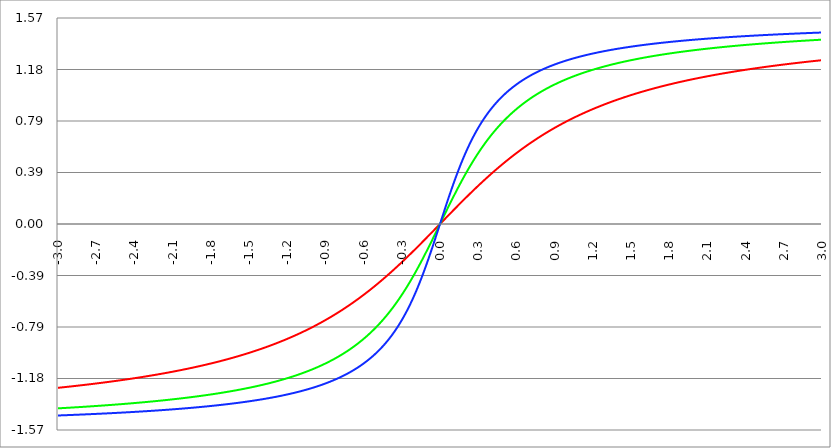
| Category | Series 1 | Series 0 | Series 2 |
|---|---|---|---|
| -3.0 | -1.249 | -1.406 | -1.46 |
| -2.997 | -1.249 | -1.405 | -1.46 |
| -2.994 | -1.248 | -1.405 | -1.46 |
| -2.991 | -1.248 | -1.405 | -1.46 |
| -2.988 | -1.248 | -1.405 | -1.46 |
| -2.984999999999999 | -1.248 | -1.405 | -1.46 |
| -2.981999999999999 | -1.247 | -1.405 | -1.459 |
| -2.978999999999999 | -1.247 | -1.405 | -1.459 |
| -2.975999999999999 | -1.247 | -1.404 | -1.459 |
| -2.972999999999999 | -1.246 | -1.404 | -1.459 |
| -2.969999999999999 | -1.246 | -1.404 | -1.459 |
| -2.966999999999999 | -1.246 | -1.404 | -1.459 |
| -2.963999999999999 | -1.245 | -1.404 | -1.459 |
| -2.960999999999998 | -1.245 | -1.404 | -1.459 |
| -2.957999999999998 | -1.245 | -1.403 | -1.459 |
| -2.954999999999998 | -1.244 | -1.403 | -1.458 |
| -2.951999999999998 | -1.244 | -1.403 | -1.458 |
| -2.948999999999998 | -1.244 | -1.403 | -1.458 |
| -2.945999999999998 | -1.244 | -1.403 | -1.458 |
| -2.942999999999998 | -1.243 | -1.403 | -1.458 |
| -2.939999999999998 | -1.243 | -1.402 | -1.458 |
| -2.936999999999998 | -1.243 | -1.402 | -1.458 |
| -2.933999999999997 | -1.242 | -1.402 | -1.458 |
| -2.930999999999997 | -1.242 | -1.402 | -1.458 |
| -2.927999999999997 | -1.242 | -1.402 | -1.457 |
| -2.924999999999997 | -1.241 | -1.401 | -1.457 |
| -2.921999999999997 | -1.241 | -1.401 | -1.457 |
| -2.918999999999997 | -1.241 | -1.401 | -1.457 |
| -2.915999999999997 | -1.24 | -1.401 | -1.457 |
| -2.912999999999997 | -1.24 | -1.401 | -1.457 |
| -2.909999999999997 | -1.24 | -1.401 | -1.457 |
| -2.906999999999996 | -1.239 | -1.4 | -1.457 |
| -2.903999999999996 | -1.239 | -1.4 | -1.457 |
| -2.900999999999996 | -1.239 | -1.4 | -1.456 |
| -2.897999999999996 | -1.239 | -1.4 | -1.456 |
| -2.894999999999996 | -1.238 | -1.4 | -1.456 |
| -2.891999999999996 | -1.238 | -1.4 | -1.456 |
| -2.888999999999996 | -1.238 | -1.399 | -1.456 |
| -2.885999999999996 | -1.237 | -1.399 | -1.456 |
| -2.882999999999996 | -1.237 | -1.399 | -1.456 |
| -2.879999999999995 | -1.237 | -1.399 | -1.456 |
| -2.876999999999995 | -1.236 | -1.399 | -1.455 |
| -2.873999999999995 | -1.236 | -1.399 | -1.455 |
| -2.870999999999995 | -1.236 | -1.398 | -1.455 |
| -2.867999999999995 | -1.235 | -1.398 | -1.455 |
| -2.864999999999995 | -1.235 | -1.398 | -1.455 |
| -2.861999999999995 | -1.235 | -1.398 | -1.455 |
| -2.858999999999995 | -1.234 | -1.398 | -1.455 |
| -2.855999999999994 | -1.234 | -1.397 | -1.455 |
| -2.852999999999994 | -1.234 | -1.397 | -1.454 |
| -2.849999999999994 | -1.233 | -1.397 | -1.454 |
| -2.846999999999994 | -1.233 | -1.397 | -1.454 |
| -2.843999999999994 | -1.233 | -1.397 | -1.454 |
| -2.840999999999994 | -1.232 | -1.397 | -1.454 |
| -2.837999999999994 | -1.232 | -1.396 | -1.454 |
| -2.834999999999994 | -1.232 | -1.396 | -1.454 |
| -2.831999999999994 | -1.231 | -1.396 | -1.454 |
| -2.828999999999993 | -1.231 | -1.396 | -1.454 |
| -2.825999999999993 | -1.231 | -1.396 | -1.453 |
| -2.822999999999993 | -1.23 | -1.395 | -1.453 |
| -2.819999999999993 | -1.23 | -1.395 | -1.453 |
| -2.816999999999993 | -1.23 | -1.395 | -1.453 |
| -2.813999999999993 | -1.229 | -1.395 | -1.453 |
| -2.810999999999993 | -1.229 | -1.395 | -1.453 |
| -2.807999999999993 | -1.229 | -1.395 | -1.453 |
| -2.804999999999993 | -1.228 | -1.394 | -1.453 |
| -2.801999999999992 | -1.228 | -1.394 | -1.452 |
| -2.798999999999992 | -1.228 | -1.394 | -1.452 |
| -2.795999999999992 | -1.227 | -1.394 | -1.452 |
| -2.792999999999992 | -1.227 | -1.394 | -1.452 |
| -2.789999999999992 | -1.227 | -1.393 | -1.452 |
| -2.786999999999992 | -1.226 | -1.393 | -1.452 |
| -2.783999999999992 | -1.226 | -1.393 | -1.452 |
| -2.780999999999992 | -1.226 | -1.393 | -1.452 |
| -2.777999999999992 | -1.225 | -1.393 | -1.451 |
| -2.774999999999991 | -1.225 | -1.393 | -1.451 |
| -2.771999999999991 | -1.225 | -1.392 | -1.451 |
| -2.768999999999991 | -1.224 | -1.392 | -1.451 |
| -2.765999999999991 | -1.224 | -1.392 | -1.451 |
| -2.762999999999991 | -1.224 | -1.392 | -1.451 |
| -2.759999999999991 | -1.223 | -1.392 | -1.451 |
| -2.756999999999991 | -1.223 | -1.391 | -1.45 |
| -2.753999999999991 | -1.222 | -1.391 | -1.45 |
| -2.75099999999999 | -1.222 | -1.391 | -1.45 |
| -2.74799999999999 | -1.222 | -1.391 | -1.45 |
| -2.74499999999999 | -1.221 | -1.391 | -1.45 |
| -2.74199999999999 | -1.221 | -1.39 | -1.45 |
| -2.73899999999999 | -1.221 | -1.39 | -1.45 |
| -2.73599999999999 | -1.22 | -1.39 | -1.45 |
| -2.73299999999999 | -1.22 | -1.39 | -1.449 |
| -2.72999999999999 | -1.22 | -1.39 | -1.449 |
| -2.72699999999999 | -1.219 | -1.389 | -1.449 |
| -2.723999999999989 | -1.219 | -1.389 | -1.449 |
| -2.720999999999989 | -1.219 | -1.389 | -1.449 |
| -2.717999999999989 | -1.218 | -1.389 | -1.449 |
| -2.714999999999989 | -1.218 | -1.389 | -1.449 |
| -2.711999999999989 | -1.218 | -1.388 | -1.448 |
| -2.708999999999989 | -1.217 | -1.388 | -1.448 |
| -2.705999999999989 | -1.217 | -1.388 | -1.448 |
| -2.702999999999989 | -1.216 | -1.388 | -1.448 |
| -2.699999999999989 | -1.216 | -1.388 | -1.448 |
| -2.696999999999988 | -1.216 | -1.387 | -1.448 |
| -2.693999999999988 | -1.215 | -1.387 | -1.448 |
| -2.690999999999988 | -1.215 | -1.387 | -1.448 |
| -2.687999999999988 | -1.215 | -1.387 | -1.447 |
| -2.684999999999988 | -1.214 | -1.387 | -1.447 |
| -2.681999999999988 | -1.214 | -1.386 | -1.447 |
| -2.678999999999988 | -1.214 | -1.386 | -1.447 |
| -2.675999999999988 | -1.213 | -1.386 | -1.447 |
| -2.672999999999988 | -1.213 | -1.386 | -1.447 |
| -2.669999999999987 | -1.212 | -1.386 | -1.447 |
| -2.666999999999987 | -1.212 | -1.385 | -1.446 |
| -2.663999999999987 | -1.212 | -1.385 | -1.446 |
| -2.660999999999987 | -1.211 | -1.385 | -1.446 |
| -2.657999999999987 | -1.211 | -1.385 | -1.446 |
| -2.654999999999987 | -1.211 | -1.385 | -1.446 |
| -2.651999999999987 | -1.21 | -1.384 | -1.446 |
| -2.648999999999987 | -1.21 | -1.384 | -1.446 |
| -2.645999999999986 | -1.209 | -1.384 | -1.445 |
| -2.642999999999986 | -1.209 | -1.384 | -1.445 |
| -2.639999999999986 | -1.209 | -1.384 | -1.445 |
| -2.636999999999986 | -1.208 | -1.383 | -1.445 |
| -2.633999999999986 | -1.208 | -1.383 | -1.445 |
| -2.630999999999986 | -1.208 | -1.383 | -1.445 |
| -2.627999999999986 | -1.207 | -1.383 | -1.445 |
| -2.624999999999986 | -1.207 | -1.383 | -1.444 |
| -2.621999999999986 | -1.206 | -1.382 | -1.444 |
| -2.618999999999985 | -1.206 | -1.382 | -1.444 |
| -2.615999999999985 | -1.206 | -1.382 | -1.444 |
| -2.612999999999985 | -1.205 | -1.382 | -1.444 |
| -2.609999999999985 | -1.205 | -1.382 | -1.444 |
| -2.606999999999985 | -1.205 | -1.381 | -1.444 |
| -2.603999999999985 | -1.204 | -1.381 | -1.443 |
| -2.600999999999985 | -1.204 | -1.381 | -1.443 |
| -2.597999999999985 | -1.203 | -1.381 | -1.443 |
| -2.594999999999985 | -1.203 | -1.38 | -1.443 |
| -2.591999999999985 | -1.203 | -1.38 | -1.443 |
| -2.588999999999984 | -1.202 | -1.38 | -1.443 |
| -2.585999999999984 | -1.202 | -1.38 | -1.443 |
| -2.582999999999984 | -1.201 | -1.38 | -1.442 |
| -2.579999999999984 | -1.201 | -1.379 | -1.442 |
| -2.576999999999984 | -1.201 | -1.379 | -1.442 |
| -2.573999999999984 | -1.2 | -1.379 | -1.442 |
| -2.570999999999984 | -1.2 | -1.379 | -1.442 |
| -2.567999999999984 | -1.199 | -1.378 | -1.442 |
| -2.564999999999984 | -1.199 | -1.378 | -1.442 |
| -2.561999999999983 | -1.199 | -1.378 | -1.441 |
| -2.558999999999983 | -1.198 | -1.378 | -1.441 |
| -2.555999999999983 | -1.198 | -1.378 | -1.441 |
| -2.552999999999983 | -1.197 | -1.377 | -1.441 |
| -2.549999999999983 | -1.197 | -1.377 | -1.441 |
| -2.546999999999983 | -1.197 | -1.377 | -1.441 |
| -2.543999999999983 | -1.196 | -1.377 | -1.441 |
| -2.540999999999983 | -1.196 | -1.377 | -1.44 |
| -2.537999999999982 | -1.195 | -1.376 | -1.44 |
| -2.534999999999982 | -1.195 | -1.376 | -1.44 |
| -2.531999999999982 | -1.195 | -1.376 | -1.44 |
| -2.528999999999982 | -1.194 | -1.376 | -1.44 |
| -2.525999999999982 | -1.194 | -1.375 | -1.44 |
| -2.522999999999982 | -1.193 | -1.375 | -1.439 |
| -2.519999999999982 | -1.193 | -1.375 | -1.439 |
| -2.516999999999982 | -1.193 | -1.375 | -1.439 |
| -2.513999999999982 | -1.192 | -1.374 | -1.439 |
| -2.510999999999981 | -1.192 | -1.374 | -1.439 |
| -2.507999999999981 | -1.191 | -1.374 | -1.439 |
| -2.504999999999981 | -1.191 | -1.374 | -1.439 |
| -2.501999999999981 | -1.191 | -1.374 | -1.438 |
| -2.498999999999981 | -1.19 | -1.373 | -1.438 |
| -2.495999999999981 | -1.19 | -1.373 | -1.438 |
| -2.492999999999981 | -1.189 | -1.373 | -1.438 |
| -2.489999999999981 | -1.189 | -1.373 | -1.438 |
| -2.486999999999981 | -1.188 | -1.372 | -1.438 |
| -2.48399999999998 | -1.188 | -1.372 | -1.437 |
| -2.48099999999998 | -1.188 | -1.372 | -1.437 |
| -2.47799999999998 | -1.187 | -1.372 | -1.437 |
| -2.47499999999998 | -1.187 | -1.371 | -1.437 |
| -2.47199999999998 | -1.186 | -1.371 | -1.437 |
| -2.46899999999998 | -1.186 | -1.371 | -1.437 |
| -2.46599999999998 | -1.186 | -1.371 | -1.436 |
| -2.46299999999998 | -1.185 | -1.371 | -1.436 |
| -2.45999999999998 | -1.185 | -1.37 | -1.436 |
| -2.456999999999979 | -1.184 | -1.37 | -1.436 |
| -2.453999999999979 | -1.184 | -1.37 | -1.436 |
| -2.450999999999979 | -1.183 | -1.37 | -1.436 |
| -2.44799999999998 | -1.183 | -1.369 | -1.435 |
| -2.444999999999979 | -1.183 | -1.369 | -1.435 |
| -2.441999999999979 | -1.182 | -1.369 | -1.435 |
| -2.438999999999979 | -1.182 | -1.369 | -1.435 |
| -2.435999999999979 | -1.181 | -1.368 | -1.435 |
| -2.432999999999978 | -1.181 | -1.368 | -1.435 |
| -2.429999999999978 | -1.18 | -1.368 | -1.434 |
| -2.426999999999978 | -1.18 | -1.368 | -1.434 |
| -2.423999999999978 | -1.18 | -1.367 | -1.434 |
| -2.420999999999978 | -1.179 | -1.367 | -1.434 |
| -2.417999999999978 | -1.179 | -1.367 | -1.434 |
| -2.414999999999978 | -1.178 | -1.367 | -1.434 |
| -2.411999999999978 | -1.178 | -1.366 | -1.433 |
| -2.408999999999978 | -1.177 | -1.366 | -1.433 |
| -2.405999999999977 | -1.177 | -1.366 | -1.433 |
| -2.402999999999977 | -1.176 | -1.366 | -1.433 |
| -2.399999999999977 | -1.176 | -1.365 | -1.433 |
| -2.396999999999977 | -1.176 | -1.365 | -1.433 |
| -2.393999999999977 | -1.175 | -1.365 | -1.432 |
| -2.390999999999977 | -1.175 | -1.365 | -1.432 |
| -2.387999999999977 | -1.174 | -1.364 | -1.432 |
| -2.384999999999977 | -1.174 | -1.364 | -1.432 |
| -2.381999999999977 | -1.173 | -1.364 | -1.432 |
| -2.378999999999976 | -1.173 | -1.364 | -1.432 |
| -2.375999999999976 | -1.172 | -1.363 | -1.431 |
| -2.372999999999976 | -1.172 | -1.363 | -1.431 |
| -2.369999999999976 | -1.172 | -1.363 | -1.431 |
| -2.366999999999976 | -1.171 | -1.363 | -1.431 |
| -2.363999999999976 | -1.171 | -1.362 | -1.431 |
| -2.360999999999976 | -1.17 | -1.362 | -1.431 |
| -2.357999999999976 | -1.17 | -1.362 | -1.43 |
| -2.354999999999976 | -1.169 | -1.362 | -1.43 |
| -2.351999999999975 | -1.169 | -1.361 | -1.43 |
| -2.348999999999975 | -1.168 | -1.361 | -1.43 |
| -2.345999999999975 | -1.168 | -1.361 | -1.43 |
| -2.342999999999975 | -1.167 | -1.361 | -1.429 |
| -2.339999999999975 | -1.167 | -1.36 | -1.429 |
| -2.336999999999975 | -1.166 | -1.36 | -1.429 |
| -2.333999999999975 | -1.166 | -1.36 | -1.429 |
| -2.330999999999975 | -1.166 | -1.359 | -1.429 |
| -2.327999999999974 | -1.165 | -1.359 | -1.429 |
| -2.324999999999974 | -1.165 | -1.359 | -1.428 |
| -2.321999999999974 | -1.164 | -1.359 | -1.428 |
| -2.318999999999974 | -1.164 | -1.358 | -1.428 |
| -2.315999999999974 | -1.163 | -1.358 | -1.428 |
| -2.312999999999974 | -1.163 | -1.358 | -1.428 |
| -2.309999999999974 | -1.162 | -1.358 | -1.427 |
| -2.306999999999974 | -1.162 | -1.357 | -1.427 |
| -2.303999999999974 | -1.161 | -1.357 | -1.427 |
| -2.300999999999973 | -1.161 | -1.357 | -1.427 |
| -2.297999999999973 | -1.16 | -1.357 | -1.427 |
| -2.294999999999973 | -1.16 | -1.356 | -1.427 |
| -2.291999999999973 | -1.159 | -1.356 | -1.426 |
| -2.288999999999973 | -1.159 | -1.356 | -1.426 |
| -2.285999999999973 | -1.158 | -1.355 | -1.426 |
| -2.282999999999973 | -1.158 | -1.355 | -1.426 |
| -2.279999999999973 | -1.157 | -1.355 | -1.426 |
| -2.276999999999973 | -1.157 | -1.355 | -1.425 |
| -2.273999999999972 | -1.156 | -1.354 | -1.425 |
| -2.270999999999972 | -1.156 | -1.354 | -1.425 |
| -2.267999999999972 | -1.156 | -1.354 | -1.425 |
| -2.264999999999972 | -1.155 | -1.354 | -1.425 |
| -2.261999999999972 | -1.155 | -1.353 | -1.424 |
| -2.258999999999972 | -1.154 | -1.353 | -1.424 |
| -2.255999999999972 | -1.154 | -1.353 | -1.424 |
| -2.252999999999972 | -1.153 | -1.352 | -1.424 |
| -2.249999999999972 | -1.153 | -1.352 | -1.424 |
| -2.246999999999971 | -1.152 | -1.352 | -1.424 |
| -2.243999999999971 | -1.152 | -1.352 | -1.423 |
| -2.240999999999971 | -1.151 | -1.351 | -1.423 |
| -2.237999999999971 | -1.151 | -1.351 | -1.423 |
| -2.234999999999971 | -1.15 | -1.351 | -1.423 |
| -2.231999999999971 | -1.15 | -1.35 | -1.423 |
| -2.228999999999971 | -1.149 | -1.35 | -1.422 |
| -2.225999999999971 | -1.149 | -1.35 | -1.422 |
| -2.222999999999971 | -1.148 | -1.35 | -1.422 |
| -2.21999999999997 | -1.148 | -1.349 | -1.422 |
| -2.21699999999997 | -1.147 | -1.349 | -1.422 |
| -2.21399999999997 | -1.147 | -1.349 | -1.421 |
| -2.21099999999997 | -1.146 | -1.348 | -1.421 |
| -2.20799999999997 | -1.146 | -1.348 | -1.421 |
| -2.20499999999997 | -1.145 | -1.348 | -1.421 |
| -2.20199999999997 | -1.145 | -1.348 | -1.421 |
| -2.19899999999997 | -1.144 | -1.347 | -1.42 |
| -2.19599999999997 | -1.143 | -1.347 | -1.42 |
| -2.192999999999969 | -1.143 | -1.347 | -1.42 |
| -2.189999999999969 | -1.142 | -1.346 | -1.42 |
| -2.186999999999969 | -1.142 | -1.346 | -1.42 |
| -2.18399999999997 | -1.141 | -1.346 | -1.419 |
| -2.180999999999969 | -1.141 | -1.345 | -1.419 |
| -2.177999999999969 | -1.14 | -1.345 | -1.419 |
| -2.174999999999969 | -1.14 | -1.345 | -1.419 |
| -2.171999999999969 | -1.139 | -1.345 | -1.419 |
| -2.168999999999968 | -1.139 | -1.344 | -1.418 |
| -2.165999999999968 | -1.138 | -1.344 | -1.418 |
| -2.162999999999968 | -1.138 | -1.344 | -1.418 |
| -2.159999999999968 | -1.137 | -1.343 | -1.418 |
| -2.156999999999968 | -1.137 | -1.343 | -1.417 |
| -2.153999999999968 | -1.136 | -1.343 | -1.417 |
| -2.150999999999968 | -1.136 | -1.342 | -1.417 |
| -2.147999999999968 | -1.135 | -1.342 | -1.417 |
| -2.144999999999968 | -1.135 | -1.342 | -1.417 |
| -2.141999999999967 | -1.134 | -1.341 | -1.416 |
| -2.138999999999967 | -1.133 | -1.341 | -1.416 |
| -2.135999999999967 | -1.133 | -1.341 | -1.416 |
| -2.132999999999967 | -1.132 | -1.341 | -1.416 |
| -2.129999999999967 | -1.132 | -1.34 | -1.416 |
| -2.126999999999967 | -1.131 | -1.34 | -1.415 |
| -2.123999999999967 | -1.131 | -1.34 | -1.415 |
| -2.120999999999967 | -1.13 | -1.339 | -1.415 |
| -2.117999999999967 | -1.13 | -1.339 | -1.415 |
| -2.114999999999966 | -1.129 | -1.339 | -1.414 |
| -2.111999999999966 | -1.129 | -1.338 | -1.414 |
| -2.108999999999966 | -1.128 | -1.338 | -1.414 |
| -2.105999999999966 | -1.127 | -1.338 | -1.414 |
| -2.102999999999966 | -1.127 | -1.337 | -1.414 |
| -2.099999999999966 | -1.126 | -1.337 | -1.413 |
| -2.096999999999966 | -1.126 | -1.337 | -1.413 |
| -2.093999999999966 | -1.125 | -1.336 | -1.413 |
| -2.090999999999966 | -1.125 | -1.336 | -1.413 |
| -2.087999999999965 | -1.124 | -1.336 | -1.412 |
| -2.084999999999965 | -1.124 | -1.335 | -1.412 |
| -2.081999999999965 | -1.123 | -1.335 | -1.412 |
| -2.078999999999965 | -1.122 | -1.335 | -1.412 |
| -2.075999999999965 | -1.122 | -1.334 | -1.412 |
| -2.072999999999965 | -1.121 | -1.334 | -1.411 |
| -2.069999999999965 | -1.121 | -1.334 | -1.411 |
| -2.066999999999965 | -1.12 | -1.333 | -1.411 |
| -2.063999999999965 | -1.12 | -1.333 | -1.411 |
| -2.060999999999964 | -1.119 | -1.333 | -1.41 |
| -2.057999999999964 | -1.118 | -1.332 | -1.41 |
| -2.054999999999964 | -1.118 | -1.332 | -1.41 |
| -2.051999999999964 | -1.117 | -1.332 | -1.41 |
| -2.048999999999964 | -1.117 | -1.331 | -1.41 |
| -2.045999999999964 | -1.116 | -1.331 | -1.409 |
| -2.042999999999964 | -1.116 | -1.331 | -1.409 |
| -2.039999999999964 | -1.115 | -1.33 | -1.409 |
| -2.036999999999963 | -1.114 | -1.33 | -1.409 |
| -2.033999999999963 | -1.114 | -1.33 | -1.408 |
| -2.030999999999963 | -1.113 | -1.329 | -1.408 |
| -2.027999999999963 | -1.113 | -1.329 | -1.408 |
| -2.024999999999963 | -1.112 | -1.329 | -1.408 |
| -2.021999999999963 | -1.112 | -1.328 | -1.407 |
| -2.018999999999963 | -1.111 | -1.328 | -1.407 |
| -2.015999999999963 | -1.11 | -1.328 | -1.407 |
| -2.012999999999963 | -1.11 | -1.327 | -1.407 |
| -2.009999999999962 | -1.109 | -1.327 | -1.406 |
| -2.006999999999962 | -1.109 | -1.327 | -1.406 |
| -2.003999999999962 | -1.108 | -1.326 | -1.406 |
| -2.000999999999962 | -1.107 | -1.326 | -1.406 |
| -1.997999999999962 | -1.107 | -1.326 | -1.405 |
| -1.994999999999962 | -1.106 | -1.325 | -1.405 |
| -1.991999999999962 | -1.106 | -1.325 | -1.405 |
| -1.988999999999963 | -1.105 | -1.325 | -1.405 |
| -1.985999999999963 | -1.104 | -1.324 | -1.405 |
| -1.982999999999963 | -1.104 | -1.324 | -1.404 |
| -1.979999999999963 | -1.103 | -1.323 | -1.404 |
| -1.976999999999963 | -1.103 | -1.323 | -1.404 |
| -1.973999999999963 | -1.102 | -1.323 | -1.404 |
| -1.970999999999963 | -1.101 | -1.322 | -1.403 |
| -1.967999999999963 | -1.101 | -1.322 | -1.403 |
| -1.964999999999963 | -1.1 | -1.322 | -1.403 |
| -1.961999999999964 | -1.099 | -1.321 | -1.403 |
| -1.958999999999964 | -1.099 | -1.321 | -1.402 |
| -1.955999999999964 | -1.098 | -1.321 | -1.402 |
| -1.952999999999964 | -1.098 | -1.32 | -1.402 |
| -1.949999999999964 | -1.097 | -1.32 | -1.401 |
| -1.946999999999964 | -1.096 | -1.319 | -1.401 |
| -1.943999999999964 | -1.096 | -1.319 | -1.401 |
| -1.940999999999964 | -1.095 | -1.319 | -1.401 |
| -1.937999999999964 | -1.094 | -1.318 | -1.4 |
| -1.934999999999964 | -1.094 | -1.318 | -1.4 |
| -1.931999999999965 | -1.093 | -1.318 | -1.4 |
| -1.928999999999965 | -1.093 | -1.317 | -1.4 |
| -1.925999999999965 | -1.092 | -1.317 | -1.399 |
| -1.922999999999965 | -1.091 | -1.316 | -1.399 |
| -1.919999999999965 | -1.091 | -1.316 | -1.399 |
| -1.916999999999965 | -1.09 | -1.316 | -1.399 |
| -1.913999999999965 | -1.089 | -1.315 | -1.398 |
| -1.910999999999965 | -1.089 | -1.315 | -1.398 |
| -1.907999999999965 | -1.088 | -1.315 | -1.398 |
| -1.904999999999966 | -1.087 | -1.314 | -1.398 |
| -1.901999999999966 | -1.087 | -1.314 | -1.397 |
| -1.898999999999966 | -1.086 | -1.313 | -1.397 |
| -1.895999999999966 | -1.085 | -1.313 | -1.397 |
| -1.892999999999966 | -1.085 | -1.313 | -1.396 |
| -1.889999999999966 | -1.084 | -1.312 | -1.396 |
| -1.886999999999966 | -1.083 | -1.312 | -1.396 |
| -1.883999999999966 | -1.083 | -1.311 | -1.396 |
| -1.880999999999966 | -1.082 | -1.311 | -1.395 |
| -1.877999999999967 | -1.082 | -1.311 | -1.395 |
| -1.874999999999967 | -1.081 | -1.31 | -1.395 |
| -1.871999999999967 | -1.08 | -1.31 | -1.395 |
| -1.868999999999967 | -1.08 | -1.309 | -1.394 |
| -1.865999999999967 | -1.079 | -1.309 | -1.394 |
| -1.862999999999967 | -1.078 | -1.309 | -1.394 |
| -1.859999999999967 | -1.077 | -1.308 | -1.393 |
| -1.856999999999967 | -1.077 | -1.308 | -1.393 |
| -1.853999999999967 | -1.076 | -1.307 | -1.393 |
| -1.850999999999968 | -1.075 | -1.307 | -1.393 |
| -1.847999999999968 | -1.075 | -1.307 | -1.392 |
| -1.844999999999968 | -1.074 | -1.306 | -1.392 |
| -1.841999999999968 | -1.073 | -1.306 | -1.392 |
| -1.838999999999968 | -1.073 | -1.305 | -1.391 |
| -1.835999999999968 | -1.072 | -1.305 | -1.391 |
| -1.832999999999968 | -1.071 | -1.304 | -1.391 |
| -1.829999999999968 | -1.071 | -1.304 | -1.391 |
| -1.826999999999968 | -1.07 | -1.304 | -1.39 |
| -1.823999999999968 | -1.069 | -1.303 | -1.39 |
| -1.820999999999969 | -1.069 | -1.303 | -1.39 |
| -1.817999999999969 | -1.068 | -1.302 | -1.389 |
| -1.814999999999969 | -1.067 | -1.302 | -1.389 |
| -1.811999999999969 | -1.067 | -1.302 | -1.389 |
| -1.808999999999969 | -1.066 | -1.301 | -1.389 |
| -1.805999999999969 | -1.065 | -1.301 | -1.388 |
| -1.802999999999969 | -1.064 | -1.3 | -1.388 |
| -1.799999999999969 | -1.064 | -1.3 | -1.388 |
| -1.796999999999969 | -1.063 | -1.299 | -1.387 |
| -1.79399999999997 | -1.062 | -1.299 | -1.387 |
| -1.79099999999997 | -1.062 | -1.299 | -1.387 |
| -1.78799999999997 | -1.061 | -1.298 | -1.386 |
| -1.78499999999997 | -1.06 | -1.298 | -1.386 |
| -1.78199999999997 | -1.059 | -1.297 | -1.386 |
| -1.77899999999997 | -1.059 | -1.297 | -1.386 |
| -1.77599999999997 | -1.058 | -1.296 | -1.385 |
| -1.77299999999997 | -1.057 | -1.296 | -1.385 |
| -1.76999999999997 | -1.057 | -1.295 | -1.385 |
| -1.766999999999971 | -1.056 | -1.295 | -1.384 |
| -1.763999999999971 | -1.055 | -1.295 | -1.384 |
| -1.760999999999971 | -1.054 | -1.294 | -1.384 |
| -1.757999999999971 | -1.054 | -1.294 | -1.383 |
| -1.754999999999971 | -1.053 | -1.293 | -1.383 |
| -1.751999999999971 | -1.052 | -1.293 | -1.383 |
| -1.748999999999971 | -1.051 | -1.292 | -1.382 |
| -1.745999999999971 | -1.051 | -1.292 | -1.382 |
| -1.742999999999971 | -1.05 | -1.291 | -1.382 |
| -1.739999999999971 | -1.049 | -1.291 | -1.382 |
| -1.736999999999972 | -1.048 | -1.291 | -1.381 |
| -1.733999999999972 | -1.048 | -1.29 | -1.381 |
| -1.730999999999972 | -1.047 | -1.29 | -1.381 |
| -1.727999999999972 | -1.046 | -1.289 | -1.38 |
| -1.724999999999972 | -1.045 | -1.289 | -1.38 |
| -1.721999999999972 | -1.045 | -1.288 | -1.38 |
| -1.718999999999972 | -1.044 | -1.288 | -1.379 |
| -1.715999999999972 | -1.043 | -1.287 | -1.379 |
| -1.712999999999972 | -1.042 | -1.287 | -1.379 |
| -1.709999999999973 | -1.042 | -1.286 | -1.378 |
| -1.706999999999973 | -1.041 | -1.286 | -1.378 |
| -1.703999999999973 | -1.04 | -1.285 | -1.378 |
| -1.700999999999973 | -1.039 | -1.285 | -1.377 |
| -1.697999999999973 | -1.039 | -1.284 | -1.377 |
| -1.694999999999973 | -1.038 | -1.284 | -1.377 |
| -1.691999999999973 | -1.037 | -1.283 | -1.376 |
| -1.688999999999973 | -1.036 | -1.283 | -1.376 |
| -1.685999999999973 | -1.035 | -1.282 | -1.376 |
| -1.682999999999974 | -1.035 | -1.282 | -1.375 |
| -1.679999999999974 | -1.034 | -1.282 | -1.375 |
| -1.676999999999974 | -1.033 | -1.281 | -1.375 |
| -1.673999999999974 | -1.032 | -1.281 | -1.374 |
| -1.670999999999974 | -1.032 | -1.28 | -1.374 |
| -1.667999999999974 | -1.031 | -1.28 | -1.374 |
| -1.664999999999974 | -1.03 | -1.279 | -1.373 |
| -1.661999999999974 | -1.029 | -1.279 | -1.373 |
| -1.658999999999974 | -1.028 | -1.278 | -1.373 |
| -1.655999999999975 | -1.028 | -1.278 | -1.372 |
| -1.652999999999975 | -1.027 | -1.277 | -1.372 |
| -1.649999999999975 | -1.026 | -1.277 | -1.371 |
| -1.646999999999975 | -1.025 | -1.276 | -1.371 |
| -1.643999999999975 | -1.024 | -1.276 | -1.371 |
| -1.640999999999975 | -1.024 | -1.275 | -1.37 |
| -1.637999999999975 | -1.023 | -1.275 | -1.37 |
| -1.634999999999975 | -1.022 | -1.274 | -1.37 |
| -1.631999999999975 | -1.021 | -1.274 | -1.369 |
| -1.628999999999975 | -1.02 | -1.273 | -1.369 |
| -1.625999999999976 | -1.019 | -1.272 | -1.369 |
| -1.622999999999976 | -1.019 | -1.272 | -1.368 |
| -1.619999999999976 | -1.018 | -1.271 | -1.368 |
| -1.616999999999976 | -1.017 | -1.271 | -1.368 |
| -1.613999999999976 | -1.016 | -1.27 | -1.367 |
| -1.610999999999976 | -1.015 | -1.27 | -1.367 |
| -1.607999999999976 | -1.014 | -1.269 | -1.366 |
| -1.604999999999976 | -1.014 | -1.269 | -1.366 |
| -1.601999999999976 | -1.013 | -1.268 | -1.366 |
| -1.598999999999977 | -1.012 | -1.268 | -1.365 |
| -1.595999999999977 | -1.011 | -1.267 | -1.365 |
| -1.592999999999977 | -1.01 | -1.267 | -1.365 |
| -1.589999999999977 | -1.009 | -1.266 | -1.364 |
| -1.586999999999977 | -1.009 | -1.266 | -1.364 |
| -1.583999999999977 | -1.008 | -1.265 | -1.363 |
| -1.580999999999977 | -1.007 | -1.264 | -1.363 |
| -1.577999999999977 | -1.006 | -1.264 | -1.363 |
| -1.574999999999978 | -1.005 | -1.263 | -1.362 |
| -1.571999999999978 | -1.004 | -1.263 | -1.362 |
| -1.568999999999978 | -1.003 | -1.262 | -1.361 |
| -1.565999999999978 | -1.002 | -1.262 | -1.361 |
| -1.562999999999978 | -1.002 | -1.261 | -1.361 |
| -1.559999999999978 | -1.001 | -1.261 | -1.36 |
| -1.556999999999978 | -1 | -1.26 | -1.36 |
| -1.553999999999978 | -0.999 | -1.26 | -1.359 |
| -1.550999999999978 | -0.998 | -1.259 | -1.359 |
| -1.547999999999978 | -0.997 | -1.258 | -1.359 |
| -1.544999999999979 | -0.996 | -1.258 | -1.358 |
| -1.541999999999979 | -0.995 | -1.257 | -1.358 |
| -1.538999999999979 | -0.995 | -1.257 | -1.358 |
| -1.535999999999979 | -0.994 | -1.256 | -1.357 |
| -1.532999999999979 | -0.993 | -1.256 | -1.357 |
| -1.529999999999979 | -0.992 | -1.255 | -1.356 |
| -1.526999999999979 | -0.991 | -1.254 | -1.356 |
| -1.523999999999979 | -0.99 | -1.254 | -1.355 |
| -1.520999999999979 | -0.989 | -1.253 | -1.355 |
| -1.51799999999998 | -0.988 | -1.253 | -1.355 |
| -1.51499999999998 | -0.987 | -1.252 | -1.354 |
| -1.51199999999998 | -0.986 | -1.251 | -1.354 |
| -1.50899999999998 | -0.986 | -1.251 | -1.353 |
| -1.50599999999998 | -0.985 | -1.25 | -1.353 |
| -1.50299999999998 | -0.984 | -1.25 | -1.353 |
| -1.49999999999998 | -0.983 | -1.249 | -1.352 |
| -1.49699999999998 | -0.982 | -1.248 | -1.352 |
| -1.49399999999998 | -0.981 | -1.248 | -1.351 |
| -1.490999999999981 | -0.98 | -1.247 | -1.351 |
| -1.487999999999981 | -0.979 | -1.247 | -1.35 |
| -1.484999999999981 | -0.978 | -1.246 | -1.35 |
| -1.481999999999981 | -0.977 | -1.245 | -1.35 |
| -1.478999999999981 | -0.976 | -1.245 | -1.349 |
| -1.475999999999981 | -0.975 | -1.244 | -1.349 |
| -1.472999999999981 | -0.974 | -1.244 | -1.348 |
| -1.469999999999981 | -0.973 | -1.243 | -1.348 |
| -1.466999999999981 | -0.972 | -1.242 | -1.347 |
| -1.463999999999982 | -0.972 | -1.242 | -1.347 |
| -1.460999999999982 | -0.971 | -1.241 | -1.346 |
| -1.457999999999982 | -0.97 | -1.24 | -1.346 |
| -1.454999999999982 | -0.969 | -1.24 | -1.346 |
| -1.451999999999982 | -0.968 | -1.239 | -1.345 |
| -1.448999999999982 | -0.967 | -1.239 | -1.345 |
| -1.445999999999982 | -0.966 | -1.238 | -1.344 |
| -1.442999999999982 | -0.965 | -1.237 | -1.344 |
| -1.439999999999982 | -0.964 | -1.237 | -1.343 |
| -1.436999999999982 | -0.963 | -1.236 | -1.343 |
| -1.433999999999983 | -0.962 | -1.235 | -1.342 |
| -1.430999999999983 | -0.961 | -1.235 | -1.342 |
| -1.427999999999983 | -0.96 | -1.234 | -1.341 |
| -1.424999999999983 | -0.959 | -1.233 | -1.341 |
| -1.421999999999983 | -0.958 | -1.233 | -1.341 |
| -1.418999999999983 | -0.957 | -1.232 | -1.34 |
| -1.415999999999983 | -0.956 | -1.231 | -1.34 |
| -1.412999999999983 | -0.955 | -1.231 | -1.339 |
| -1.409999999999983 | -0.954 | -1.23 | -1.339 |
| -1.406999999999984 | -0.953 | -1.229 | -1.338 |
| -1.403999999999984 | -0.952 | -1.229 | -1.338 |
| -1.400999999999984 | -0.951 | -1.228 | -1.337 |
| -1.397999999999984 | -0.95 | -1.227 | -1.337 |
| -1.394999999999984 | -0.949 | -1.227 | -1.336 |
| -1.391999999999984 | -0.948 | -1.226 | -1.336 |
| -1.388999999999984 | -0.947 | -1.225 | -1.335 |
| -1.385999999999984 | -0.946 | -1.225 | -1.335 |
| -1.382999999999984 | -0.945 | -1.224 | -1.334 |
| -1.379999999999985 | -0.944 | -1.223 | -1.334 |
| -1.376999999999985 | -0.943 | -1.222 | -1.333 |
| -1.373999999999985 | -0.942 | -1.222 | -1.333 |
| -1.370999999999985 | -0.941 | -1.221 | -1.332 |
| -1.367999999999985 | -0.94 | -1.22 | -1.332 |
| -1.364999999999985 | -0.939 | -1.22 | -1.331 |
| -1.361999999999985 | -0.937 | -1.219 | -1.331 |
| -1.358999999999985 | -0.936 | -1.218 | -1.33 |
| -1.355999999999985 | -0.935 | -1.218 | -1.33 |
| -1.352999999999985 | -0.934 | -1.217 | -1.329 |
| -1.349999999999986 | -0.933 | -1.216 | -1.329 |
| -1.346999999999986 | -0.932 | -1.215 | -1.328 |
| -1.343999999999986 | -0.931 | -1.215 | -1.328 |
| -1.340999999999986 | -0.93 | -1.214 | -1.327 |
| -1.337999999999986 | -0.929 | -1.213 | -1.327 |
| -1.334999999999986 | -0.928 | -1.212 | -1.326 |
| -1.331999999999986 | -0.927 | -1.212 | -1.326 |
| -1.328999999999986 | -0.926 | -1.211 | -1.325 |
| -1.325999999999986 | -0.925 | -1.21 | -1.325 |
| -1.322999999999987 | -0.924 | -1.209 | -1.324 |
| -1.319999999999987 | -0.922 | -1.209 | -1.323 |
| -1.316999999999987 | -0.921 | -1.208 | -1.323 |
| -1.313999999999987 | -0.92 | -1.207 | -1.322 |
| -1.310999999999987 | -0.919 | -1.206 | -1.322 |
| -1.307999999999987 | -0.918 | -1.206 | -1.321 |
| -1.304999999999987 | -0.917 | -1.205 | -1.321 |
| -1.301999999999987 | -0.916 | -1.204 | -1.32 |
| -1.298999999999987 | -0.915 | -1.203 | -1.32 |
| -1.295999999999988 | -0.914 | -1.203 | -1.319 |
| -1.292999999999988 | -0.912 | -1.202 | -1.318 |
| -1.289999999999988 | -0.911 | -1.201 | -1.318 |
| -1.286999999999988 | -0.91 | -1.2 | -1.317 |
| -1.283999999999988 | -0.909 | -1.199 | -1.317 |
| -1.280999999999988 | -0.908 | -1.199 | -1.316 |
| -1.277999999999988 | -0.907 | -1.198 | -1.316 |
| -1.274999999999988 | -0.906 | -1.197 | -1.315 |
| -1.271999999999988 | -0.905 | -1.196 | -1.315 |
| -1.268999999999989 | -0.903 | -1.195 | -1.314 |
| -1.265999999999989 | -0.902 | -1.195 | -1.313 |
| -1.262999999999989 | -0.901 | -1.194 | -1.313 |
| -1.259999999999989 | -0.9 | -1.193 | -1.312 |
| -1.256999999999989 | -0.899 | -1.192 | -1.312 |
| -1.253999999999989 | -0.898 | -1.191 | -1.311 |
| -1.250999999999989 | -0.896 | -1.191 | -1.31 |
| -1.247999999999989 | -0.895 | -1.19 | -1.31 |
| -1.244999999999989 | -0.894 | -1.189 | -1.309 |
| -1.24199999999999 | -0.893 | -1.188 | -1.309 |
| -1.23899999999999 | -0.892 | -1.187 | -1.308 |
| -1.23599999999999 | -0.891 | -1.186 | -1.307 |
| -1.23299999999999 | -0.889 | -1.186 | -1.307 |
| -1.22999999999999 | -0.888 | -1.185 | -1.306 |
| -1.22699999999999 | -0.887 | -1.184 | -1.306 |
| -1.22399999999999 | -0.886 | -1.183 | -1.305 |
| -1.22099999999999 | -0.885 | -1.182 | -1.304 |
| -1.21799999999999 | -0.883 | -1.181 | -1.304 |
| -1.214999999999991 | -0.882 | -1.18 | -1.303 |
| -1.211999999999991 | -0.881 | -1.18 | -1.302 |
| -1.208999999999991 | -0.88 | -1.179 | -1.302 |
| -1.205999999999991 | -0.879 | -1.178 | -1.301 |
| -1.202999999999991 | -0.877 | -1.177 | -1.3 |
| -1.199999999999991 | -0.876 | -1.176 | -1.3 |
| -1.196999999999991 | -0.875 | -1.175 | -1.299 |
| -1.193999999999991 | -0.874 | -1.174 | -1.299 |
| -1.190999999999991 | -0.872 | -1.173 | -1.298 |
| -1.187999999999991 | -0.871 | -1.172 | -1.297 |
| -1.184999999999992 | -0.87 | -1.172 | -1.297 |
| -1.181999999999992 | -0.869 | -1.171 | -1.296 |
| -1.178999999999992 | -0.867 | -1.17 | -1.295 |
| -1.175999999999992 | -0.866 | -1.169 | -1.295 |
| -1.172999999999992 | -0.865 | -1.168 | -1.294 |
| -1.169999999999992 | -0.864 | -1.167 | -1.293 |
| -1.166999999999992 | -0.862 | -1.166 | -1.293 |
| -1.163999999999992 | -0.861 | -1.165 | -1.292 |
| -1.160999999999992 | -0.86 | -1.164 | -1.291 |
| -1.157999999999993 | -0.858 | -1.163 | -1.291 |
| -1.154999999999993 | -0.857 | -1.162 | -1.29 |
| -1.151999999999993 | -0.856 | -1.161 | -1.289 |
| -1.148999999999993 | -0.855 | -1.16 | -1.288 |
| -1.145999999999993 | -0.853 | -1.159 | -1.288 |
| -1.142999999999993 | -0.852 | -1.158 | -1.287 |
| -1.139999999999993 | -0.851 | -1.157 | -1.286 |
| -1.136999999999993 | -0.849 | -1.156 | -1.286 |
| -1.133999999999993 | -0.848 | -1.156 | -1.285 |
| -1.130999999999994 | -0.847 | -1.155 | -1.284 |
| -1.127999999999994 | -0.845 | -1.154 | -1.283 |
| -1.124999999999994 | -0.844 | -1.153 | -1.283 |
| -1.121999999999994 | -0.843 | -1.152 | -1.282 |
| -1.118999999999994 | -0.841 | -1.151 | -1.281 |
| -1.115999999999994 | -0.84 | -1.15 | -1.281 |
| -1.112999999999994 | -0.839 | -1.149 | -1.28 |
| -1.109999999999994 | -0.837 | -1.148 | -1.279 |
| -1.106999999999994 | -0.836 | -1.147 | -1.278 |
| -1.103999999999995 | -0.835 | -1.146 | -1.278 |
| -1.100999999999995 | -0.833 | -1.145 | -1.277 |
| -1.097999999999995 | -0.832 | -1.143 | -1.276 |
| -1.094999999999995 | -0.831 | -1.142 | -1.275 |
| -1.091999999999995 | -0.829 | -1.141 | -1.275 |
| -1.088999999999995 | -0.828 | -1.14 | -1.274 |
| -1.085999999999995 | -0.827 | -1.139 | -1.273 |
| -1.082999999999995 | -0.825 | -1.138 | -1.272 |
| -1.079999999999995 | -0.824 | -1.137 | -1.271 |
| -1.076999999999996 | -0.822 | -1.136 | -1.271 |
| -1.073999999999996 | -0.821 | -1.135 | -1.27 |
| -1.070999999999996 | -0.82 | -1.134 | -1.269 |
| -1.067999999999996 | -0.818 | -1.133 | -1.268 |
| -1.064999999999996 | -0.817 | -1.132 | -1.267 |
| -1.061999999999996 | -0.815 | -1.131 | -1.267 |
| -1.058999999999996 | -0.814 | -1.13 | -1.266 |
| -1.055999999999996 | -0.813 | -1.129 | -1.265 |
| -1.052999999999996 | -0.811 | -1.127 | -1.264 |
| -1.049999999999996 | -0.81 | -1.126 | -1.263 |
| -1.046999999999997 | -0.808 | -1.125 | -1.263 |
| -1.043999999999997 | -0.807 | -1.124 | -1.262 |
| -1.040999999999997 | -0.805 | -1.123 | -1.261 |
| -1.037999999999997 | -0.804 | -1.122 | -1.26 |
| -1.034999999999997 | -0.803 | -1.121 | -1.259 |
| -1.031999999999997 | -0.801 | -1.12 | -1.258 |
| -1.028999999999997 | -0.8 | -1.118 | -1.258 |
| -1.025999999999997 | -0.798 | -1.117 | -1.257 |
| -1.022999999999997 | -0.797 | -1.116 | -1.256 |
| -1.019999999999998 | -0.795 | -1.115 | -1.255 |
| -1.016999999999998 | -0.794 | -1.114 | -1.254 |
| -1.013999999999998 | -0.792 | -1.113 | -1.253 |
| -1.010999999999998 | -0.791 | -1.112 | -1.252 |
| -1.007999999999998 | -0.789 | -1.11 | -1.251 |
| -1.004999999999998 | -0.788 | -1.109 | -1.251 |
| -1.001999999999998 | -0.786 | -1.108 | -1.25 |
| -0.998999999999998 | -0.785 | -1.107 | -1.249 |
| -0.995999999999998 | -0.783 | -1.106 | -1.248 |
| -0.992999999999998 | -0.782 | -1.104 | -1.247 |
| -0.989999999999998 | -0.78 | -1.103 | -1.246 |
| -0.986999999999998 | -0.779 | -1.102 | -1.245 |
| -0.983999999999998 | -0.777 | -1.101 | -1.244 |
| -0.980999999999998 | -0.776 | -1.099 | -1.243 |
| -0.977999999999998 | -0.774 | -1.098 | -1.242 |
| -0.974999999999998 | -0.773 | -1.097 | -1.241 |
| -0.971999999999998 | -0.771 | -1.096 | -1.24 |
| -0.968999999999998 | -0.77 | -1.094 | -1.239 |
| -0.965999999999998 | -0.768 | -1.093 | -1.239 |
| -0.962999999999998 | -0.767 | -1.092 | -1.238 |
| -0.959999999999998 | -0.765 | -1.091 | -1.237 |
| -0.956999999999998 | -0.763 | -1.089 | -1.236 |
| -0.953999999999998 | -0.762 | -1.088 | -1.235 |
| -0.950999999999998 | -0.76 | -1.087 | -1.234 |
| -0.947999999999998 | -0.759 | -1.085 | -1.233 |
| -0.944999999999998 | -0.757 | -1.084 | -1.232 |
| -0.941999999999998 | -0.756 | -1.083 | -1.231 |
| -0.938999999999998 | -0.754 | -1.082 | -1.23 |
| -0.935999999999998 | -0.752 | -1.08 | -1.229 |
| -0.932999999999998 | -0.751 | -1.079 | -1.228 |
| -0.929999999999998 | -0.749 | -1.077 | -1.227 |
| -0.926999999999998 | -0.748 | -1.076 | -1.226 |
| -0.923999999999998 | -0.746 | -1.075 | -1.225 |
| -0.920999999999998 | -0.744 | -1.073 | -1.224 |
| -0.917999999999998 | -0.743 | -1.072 | -1.222 |
| -0.914999999999998 | -0.741 | -1.071 | -1.221 |
| -0.911999999999998 | -0.739 | -1.069 | -1.22 |
| -0.908999999999998 | -0.738 | -1.068 | -1.219 |
| -0.905999999999998 | -0.736 | -1.067 | -1.218 |
| -0.902999999999998 | -0.734 | -1.065 | -1.217 |
| -0.899999999999998 | -0.733 | -1.064 | -1.216 |
| -0.896999999999998 | -0.731 | -1.062 | -1.215 |
| -0.893999999999998 | -0.729 | -1.061 | -1.214 |
| -0.890999999999998 | -0.728 | -1.059 | -1.213 |
| -0.887999999999998 | -0.726 | -1.058 | -1.212 |
| -0.884999999999998 | -0.724 | -1.057 | -1.211 |
| -0.881999999999998 | -0.723 | -1.055 | -1.209 |
| -0.878999999999998 | -0.721 | -1.054 | -1.208 |
| -0.875999999999998 | -0.719 | -1.052 | -1.207 |
| -0.872999999999998 | -0.718 | -1.051 | -1.206 |
| -0.869999999999998 | -0.716 | -1.049 | -1.205 |
| -0.866999999999998 | -0.714 | -1.048 | -1.204 |
| -0.863999999999998 | -0.713 | -1.046 | -1.203 |
| -0.860999999999998 | -0.711 | -1.045 | -1.201 |
| -0.857999999999998 | -0.709 | -1.043 | -1.2 |
| -0.854999999999998 | -0.707 | -1.042 | -1.199 |
| -0.851999999999998 | -0.706 | -1.04 | -1.198 |
| -0.848999999999998 | -0.704 | -1.039 | -1.197 |
| -0.845999999999998 | -0.702 | -1.037 | -1.195 |
| -0.842999999999998 | -0.7 | -1.035 | -1.194 |
| -0.839999999999998 | -0.699 | -1.034 | -1.193 |
| -0.836999999999998 | -0.697 | -1.032 | -1.192 |
| -0.833999999999998 | -0.695 | -1.031 | -1.191 |
| -0.830999999999998 | -0.693 | -1.029 | -1.189 |
| -0.827999999999998 | -0.692 | -1.028 | -1.188 |
| -0.824999999999998 | -0.69 | -1.026 | -1.187 |
| -0.821999999999998 | -0.688 | -1.024 | -1.186 |
| -0.818999999999998 | -0.686 | -1.023 | -1.184 |
| -0.815999999999998 | -0.684 | -1.021 | -1.183 |
| -0.812999999999998 | -0.683 | -1.019 | -1.182 |
| -0.809999999999998 | -0.681 | -1.018 | -1.18 |
| -0.806999999999998 | -0.679 | -1.016 | -1.179 |
| -0.803999999999998 | -0.677 | -1.014 | -1.178 |
| -0.800999999999998 | -0.675 | -1.013 | -1.176 |
| -0.797999999999998 | -0.674 | -1.011 | -1.175 |
| -0.794999999999998 | -0.672 | -1.009 | -1.174 |
| -0.791999999999998 | -0.67 | -1.008 | -1.172 |
| -0.788999999999998 | -0.668 | -1.006 | -1.171 |
| -0.785999999999998 | -0.666 | -1.004 | -1.17 |
| -0.782999999999998 | -0.664 | -1.002 | -1.168 |
| -0.779999999999998 | -0.662 | -1.001 | -1.167 |
| -0.776999999999998 | -0.661 | -0.999 | -1.166 |
| -0.773999999999998 | -0.659 | -0.997 | -1.164 |
| -0.770999999999998 | -0.657 | -0.995 | -1.163 |
| -0.767999999999998 | -0.655 | -0.994 | -1.161 |
| -0.764999999999998 | -0.653 | -0.992 | -1.16 |
| -0.761999999999998 | -0.651 | -0.99 | -1.158 |
| -0.758999999999998 | -0.649 | -0.988 | -1.157 |
| -0.755999999999998 | -0.647 | -0.986 | -1.156 |
| -0.752999999999998 | -0.645 | -0.985 | -1.154 |
| -0.749999999999998 | -0.644 | -0.983 | -1.153 |
| -0.746999999999998 | -0.642 | -0.981 | -1.151 |
| -0.743999999999998 | -0.64 | -0.979 | -1.15 |
| -0.740999999999998 | -0.638 | -0.977 | -1.148 |
| -0.737999999999998 | -0.636 | -0.975 | -1.147 |
| -0.734999999999998 | -0.634 | -0.973 | -1.145 |
| -0.731999999999998 | -0.632 | -0.972 | -1.143 |
| -0.728999999999998 | -0.63 | -0.97 | -1.142 |
| -0.725999999999998 | -0.628 | -0.968 | -1.14 |
| -0.722999999999998 | -0.626 | -0.966 | -1.139 |
| -0.719999999999998 | -0.624 | -0.964 | -1.137 |
| -0.716999999999998 | -0.622 | -0.962 | -1.136 |
| -0.713999999999998 | -0.62 | -0.96 | -1.134 |
| -0.710999999999998 | -0.618 | -0.958 | -1.132 |
| -0.707999999999998 | -0.616 | -0.956 | -1.131 |
| -0.704999999999998 | -0.614 | -0.954 | -1.129 |
| -0.701999999999998 | -0.612 | -0.952 | -1.127 |
| -0.698999999999998 | -0.61 | -0.95 | -1.126 |
| -0.695999999999998 | -0.608 | -0.948 | -1.124 |
| -0.692999999999998 | -0.606 | -0.946 | -1.122 |
| -0.689999999999998 | -0.604 | -0.944 | -1.121 |
| -0.686999999999998 | -0.602 | -0.942 | -1.119 |
| -0.683999999999998 | -0.6 | -0.94 | -1.117 |
| -0.680999999999998 | -0.598 | -0.937 | -1.116 |
| -0.677999999999998 | -0.596 | -0.935 | -1.114 |
| -0.674999999999998 | -0.594 | -0.933 | -1.112 |
| -0.671999999999998 | -0.592 | -0.931 | -1.11 |
| -0.668999999999998 | -0.59 | -0.929 | -1.109 |
| -0.665999999999998 | -0.588 | -0.927 | -1.107 |
| -0.662999999999998 | -0.585 | -0.925 | -1.105 |
| -0.659999999999998 | -0.583 | -0.922 | -1.103 |
| -0.656999999999998 | -0.581 | -0.92 | -1.101 |
| -0.653999999999998 | -0.579 | -0.918 | -1.099 |
| -0.650999999999998 | -0.577 | -0.916 | -1.098 |
| -0.647999999999998 | -0.575 | -0.914 | -1.096 |
| -0.644999999999998 | -0.573 | -0.911 | -1.094 |
| -0.641999999999998 | -0.571 | -0.909 | -1.092 |
| -0.638999999999998 | -0.569 | -0.907 | -1.09 |
| -0.635999999999998 | -0.566 | -0.905 | -1.088 |
| -0.632999999999998 | -0.564 | -0.902 | -1.086 |
| -0.629999999999998 | -0.562 | -0.9 | -1.084 |
| -0.626999999999998 | -0.56 | -0.898 | -1.082 |
| -0.623999999999998 | -0.558 | -0.895 | -1.08 |
| -0.620999999999998 | -0.556 | -0.893 | -1.078 |
| -0.617999999999998 | -0.554 | -0.891 | -1.076 |
| -0.614999999999998 | -0.551 | -0.888 | -1.074 |
| -0.611999999999998 | -0.549 | -0.886 | -1.072 |
| -0.608999999999998 | -0.547 | -0.883 | -1.07 |
| -0.605999999999998 | -0.545 | -0.881 | -1.068 |
| -0.602999999999998 | -0.543 | -0.879 | -1.066 |
| -0.599999999999998 | -0.54 | -0.876 | -1.064 |
| -0.596999999999998 | -0.538 | -0.874 | -1.062 |
| -0.593999999999998 | -0.536 | -0.871 | -1.059 |
| -0.590999999999998 | -0.534 | -0.869 | -1.057 |
| -0.587999999999998 | -0.532 | -0.866 | -1.055 |
| -0.584999999999998 | -0.529 | -0.864 | -1.053 |
| -0.581999999999998 | -0.527 | -0.861 | -1.051 |
| -0.578999999999998 | -0.525 | -0.858 | -1.048 |
| -0.575999999999998 | -0.523 | -0.856 | -1.046 |
| -0.572999999999998 | -0.52 | -0.853 | -1.044 |
| -0.569999999999998 | -0.518 | -0.851 | -1.042 |
| -0.566999999999998 | -0.516 | -0.848 | -1.039 |
| -0.563999999999998 | -0.514 | -0.845 | -1.037 |
| -0.560999999999998 | -0.511 | -0.843 | -1.035 |
| -0.557999999999998 | -0.509 | -0.84 | -1.032 |
| -0.554999999999998 | -0.507 | -0.837 | -1.03 |
| -0.551999999999998 | -0.504 | -0.835 | -1.028 |
| -0.548999999999998 | -0.502 | -0.832 | -1.025 |
| -0.545999999999998 | -0.5 | -0.829 | -1.023 |
| -0.542999999999998 | -0.497 | -0.827 | -1.02 |
| -0.539999999999998 | -0.495 | -0.824 | -1.018 |
| -0.536999999999998 | -0.493 | -0.821 | -1.015 |
| -0.533999999999998 | -0.49 | -0.818 | -1.013 |
| -0.530999999999998 | -0.488 | -0.815 | -1.01 |
| -0.527999999999998 | -0.486 | -0.813 | -1.008 |
| -0.524999999999998 | -0.483 | -0.81 | -1.005 |
| -0.521999999999998 | -0.481 | -0.807 | -1.002 |
| -0.518999999999998 | -0.479 | -0.804 | -1 |
| -0.515999999999998 | -0.476 | -0.801 | -0.997 |
| -0.512999999999998 | -0.474 | -0.798 | -0.995 |
| -0.509999999999998 | -0.472 | -0.795 | -0.992 |
| -0.506999999999998 | -0.469 | -0.792 | -0.989 |
| -0.503999999999998 | -0.467 | -0.789 | -0.986 |
| -0.500999999999998 | -0.464 | -0.786 | -0.984 |
| -0.497999999999998 | -0.462 | -0.783 | -0.981 |
| -0.494999999999998 | -0.46 | -0.78 | -0.978 |
| -0.491999999999998 | -0.457 | -0.777 | -0.975 |
| -0.488999999999998 | -0.455 | -0.774 | -0.972 |
| -0.485999999999998 | -0.452 | -0.771 | -0.97 |
| -0.482999999999998 | -0.45 | -0.768 | -0.967 |
| -0.479999999999998 | -0.448 | -0.765 | -0.964 |
| -0.476999999999998 | -0.445 | -0.762 | -0.961 |
| -0.473999999999998 | -0.443 | -0.759 | -0.958 |
| -0.470999999999998 | -0.44 | -0.756 | -0.955 |
| -0.467999999999998 | -0.438 | -0.752 | -0.952 |
| -0.464999999999998 | -0.435 | -0.749 | -0.949 |
| -0.461999999999998 | -0.433 | -0.746 | -0.946 |
| -0.458999999999998 | -0.43 | -0.743 | -0.943 |
| -0.455999999999998 | -0.428 | -0.739 | -0.94 |
| -0.452999999999998 | -0.425 | -0.736 | -0.936 |
| -0.449999999999998 | -0.423 | -0.733 | -0.933 |
| -0.446999999999998 | -0.42 | -0.729 | -0.93 |
| -0.443999999999998 | -0.418 | -0.726 | -0.927 |
| -0.440999999999998 | -0.415 | -0.723 | -0.924 |
| -0.437999999999998 | -0.413 | -0.719 | -0.92 |
| -0.434999999999998 | -0.41 | -0.716 | -0.917 |
| -0.431999999999998 | -0.408 | -0.713 | -0.914 |
| -0.428999999999998 | -0.405 | -0.709 | -0.91 |
| -0.425999999999998 | -0.403 | -0.706 | -0.907 |
| -0.422999999999998 | -0.4 | -0.702 | -0.903 |
| -0.419999999999998 | -0.398 | -0.699 | -0.9 |
| -0.416999999999998 | -0.395 | -0.695 | -0.896 |
| -0.413999999999998 | -0.393 | -0.692 | -0.893 |
| -0.410999999999998 | -0.39 | -0.688 | -0.889 |
| -0.407999999999998 | -0.387 | -0.684 | -0.886 |
| -0.404999999999998 | -0.385 | -0.681 | -0.882 |
| -0.401999999999998 | -0.382 | -0.677 | -0.879 |
| -0.398999999999998 | -0.38 | -0.674 | -0.875 |
| -0.395999999999998 | -0.377 | -0.67 | -0.871 |
| -0.392999999999998 | -0.374 | -0.666 | -0.867 |
| -0.389999999999998 | -0.372 | -0.662 | -0.864 |
| -0.386999999999998 | -0.369 | -0.659 | -0.86 |
| -0.383999999999998 | -0.367 | -0.655 | -0.856 |
| -0.380999999999998 | -0.364 | -0.651 | -0.852 |
| -0.377999999999998 | -0.361 | -0.647 | -0.848 |
| -0.374999999999998 | -0.359 | -0.644 | -0.844 |
| -0.371999999999998 | -0.356 | -0.64 | -0.84 |
| -0.368999999999998 | -0.354 | -0.636 | -0.836 |
| -0.365999999999998 | -0.351 | -0.632 | -0.832 |
| -0.362999999999998 | -0.348 | -0.628 | -0.828 |
| -0.359999999999998 | -0.346 | -0.624 | -0.824 |
| -0.356999999999998 | -0.343 | -0.62 | -0.82 |
| -0.353999999999998 | -0.34 | -0.616 | -0.815 |
| -0.350999999999998 | -0.338 | -0.612 | -0.811 |
| -0.347999999999998 | -0.335 | -0.608 | -0.807 |
| -0.344999999999998 | -0.332 | -0.604 | -0.803 |
| -0.341999999999998 | -0.33 | -0.6 | -0.798 |
| -0.338999999999998 | -0.327 | -0.596 | -0.794 |
| -0.335999999999998 | -0.324 | -0.592 | -0.789 |
| -0.332999999999998 | -0.321 | -0.588 | -0.785 |
| -0.329999999999998 | -0.319 | -0.583 | -0.78 |
| -0.326999999999998 | -0.316 | -0.579 | -0.776 |
| -0.323999999999998 | -0.313 | -0.575 | -0.771 |
| -0.320999999999998 | -0.311 | -0.571 | -0.767 |
| -0.317999999999998 | -0.308 | -0.566 | -0.762 |
| -0.314999999999998 | -0.305 | -0.562 | -0.757 |
| -0.311999999999998 | -0.302 | -0.558 | -0.752 |
| -0.308999999999998 | -0.3 | -0.554 | -0.748 |
| -0.305999999999998 | -0.297 | -0.549 | -0.743 |
| -0.302999999999998 | -0.294 | -0.545 | -0.738 |
| -0.299999999999998 | -0.291 | -0.54 | -0.733 |
| -0.296999999999998 | -0.289 | -0.536 | -0.728 |
| -0.293999999999998 | -0.286 | -0.532 | -0.723 |
| -0.290999999999998 | -0.283 | -0.527 | -0.718 |
| -0.287999999999998 | -0.28 | -0.523 | -0.713 |
| -0.284999999999998 | -0.278 | -0.518 | -0.707 |
| -0.281999999999998 | -0.275 | -0.514 | -0.702 |
| -0.278999999999998 | -0.272 | -0.509 | -0.697 |
| -0.275999999999998 | -0.269 | -0.504 | -0.692 |
| -0.272999999999998 | -0.267 | -0.5 | -0.686 |
| -0.269999999999998 | -0.264 | -0.495 | -0.681 |
| -0.266999999999998 | -0.261 | -0.49 | -0.675 |
| -0.263999999999998 | -0.258 | -0.486 | -0.67 |
| -0.260999999999998 | -0.255 | -0.481 | -0.664 |
| -0.257999999999998 | -0.252 | -0.476 | -0.659 |
| -0.254999999999998 | -0.25 | -0.472 | -0.653 |
| -0.251999999999998 | -0.247 | -0.467 | -0.647 |
| -0.248999999999998 | -0.244 | -0.462 | -0.642 |
| -0.245999999999998 | -0.241 | -0.457 | -0.636 |
| -0.242999999999998 | -0.238 | -0.452 | -0.63 |
| -0.239999999999998 | -0.236 | -0.448 | -0.624 |
| -0.236999999999998 | -0.233 | -0.443 | -0.618 |
| -0.233999999999998 | -0.23 | -0.438 | -0.612 |
| -0.230999999999998 | -0.227 | -0.433 | -0.606 |
| -0.227999999999998 | -0.224 | -0.428 | -0.6 |
| -0.224999999999998 | -0.221 | -0.423 | -0.594 |
| -0.221999999999998 | -0.218 | -0.418 | -0.588 |
| -0.218999999999998 | -0.216 | -0.413 | -0.581 |
| -0.215999999999998 | -0.213 | -0.408 | -0.575 |
| -0.212999999999998 | -0.21 | -0.403 | -0.569 |
| -0.209999999999998 | -0.207 | -0.398 | -0.562 |
| -0.206999999999998 | -0.204 | -0.393 | -0.556 |
| -0.203999999999998 | -0.201 | -0.387 | -0.549 |
| -0.200999999999998 | -0.198 | -0.382 | -0.543 |
| -0.197999999999997 | -0.195 | -0.377 | -0.536 |
| -0.194999999999997 | -0.193 | -0.372 | -0.529 |
| -0.191999999999997 | -0.19 | -0.367 | -0.523 |
| -0.188999999999997 | -0.187 | -0.361 | -0.516 |
| -0.185999999999997 | -0.184 | -0.356 | -0.509 |
| -0.182999999999997 | -0.181 | -0.351 | -0.502 |
| -0.179999999999997 | -0.178 | -0.346 | -0.495 |
| -0.176999999999997 | -0.175 | -0.34 | -0.488 |
| -0.173999999999997 | -0.172 | -0.335 | -0.481 |
| -0.170999999999997 | -0.169 | -0.33 | -0.474 |
| -0.167999999999997 | -0.166 | -0.324 | -0.467 |
| -0.164999999999997 | -0.164 | -0.319 | -0.46 |
| -0.161999999999997 | -0.161 | -0.313 | -0.452 |
| -0.158999999999997 | -0.158 | -0.308 | -0.445 |
| -0.155999999999997 | -0.155 | -0.302 | -0.438 |
| -0.152999999999997 | -0.152 | -0.297 | -0.43 |
| -0.149999999999997 | -0.149 | -0.291 | -0.423 |
| -0.146999999999997 | -0.146 | -0.286 | -0.415 |
| -0.143999999999997 | -0.143 | -0.28 | -0.408 |
| -0.140999999999997 | -0.14 | -0.275 | -0.4 |
| -0.137999999999997 | -0.137 | -0.269 | -0.393 |
| -0.134999999999997 | -0.134 | -0.264 | -0.385 |
| -0.131999999999997 | -0.131 | -0.258 | -0.377 |
| -0.128999999999997 | -0.128 | -0.252 | -0.369 |
| -0.125999999999997 | -0.125 | -0.247 | -0.361 |
| -0.122999999999997 | -0.122 | -0.241 | -0.354 |
| -0.119999999999997 | -0.119 | -0.236 | -0.346 |
| -0.116999999999997 | -0.116 | -0.23 | -0.338 |
| -0.113999999999997 | -0.114 | -0.224 | -0.33 |
| -0.110999999999997 | -0.111 | -0.218 | -0.321 |
| -0.107999999999997 | -0.108 | -0.213 | -0.313 |
| -0.104999999999997 | -0.105 | -0.207 | -0.305 |
| -0.101999999999997 | -0.102 | -0.201 | -0.297 |
| -0.0989999999999974 | -0.099 | -0.195 | -0.289 |
| -0.0959999999999974 | -0.096 | -0.19 | -0.28 |
| -0.0929999999999974 | -0.093 | -0.184 | -0.272 |
| -0.0899999999999974 | -0.09 | -0.178 | -0.264 |
| -0.0869999999999974 | -0.087 | -0.172 | -0.255 |
| -0.0839999999999974 | -0.084 | -0.166 | -0.247 |
| -0.0809999999999974 | -0.081 | -0.161 | -0.238 |
| -0.0779999999999974 | -0.078 | -0.155 | -0.23 |
| -0.0749999999999974 | -0.075 | -0.149 | -0.221 |
| -0.0719999999999974 | -0.072 | -0.143 | -0.213 |
| -0.0689999999999974 | -0.069 | -0.137 | -0.204 |
| -0.0659999999999974 | -0.066 | -0.131 | -0.195 |
| -0.0629999999999974 | -0.063 | -0.125 | -0.187 |
| -0.0599999999999974 | -0.06 | -0.119 | -0.178 |
| -0.0569999999999974 | -0.057 | -0.114 | -0.169 |
| -0.0539999999999974 | -0.054 | -0.108 | -0.161 |
| -0.0509999999999974 | -0.051 | -0.102 | -0.152 |
| -0.0479999999999974 | -0.048 | -0.096 | -0.143 |
| -0.0449999999999974 | -0.045 | -0.09 | -0.134 |
| -0.0419999999999974 | -0.042 | -0.084 | -0.125 |
| -0.0389999999999974 | -0.039 | -0.078 | -0.116 |
| -0.0359999999999974 | -0.036 | -0.072 | -0.108 |
| -0.0329999999999974 | -0.033 | -0.066 | -0.099 |
| -0.0299999999999974 | -0.03 | -0.06 | -0.09 |
| -0.0269999999999974 | -0.027 | -0.054 | -0.081 |
| -0.0239999999999974 | -0.024 | -0.048 | -0.072 |
| -0.0209999999999974 | -0.021 | -0.042 | -0.063 |
| -0.0179999999999974 | -0.018 | -0.036 | -0.054 |
| -0.0149999999999974 | -0.015 | -0.03 | -0.045 |
| -0.0119999999999974 | -0.012 | -0.024 | -0.036 |
| -0.00899999999999737 | -0.009 | -0.018 | -0.027 |
| -0.00599999999999737 | -0.006 | -0.012 | -0.018 |
| -0.00299999999999737 | -0.003 | -0.006 | -0.009 |
| 2.62897342784285e-15 | 0 | 0 | 0 |
| 0.00300000000000263 | 0.003 | 0.006 | 0.009 |
| 0.00600000000000263 | 0.006 | 0.012 | 0.018 |
| 0.00900000000000263 | 0.009 | 0.018 | 0.027 |
| 0.0120000000000026 | 0.012 | 0.024 | 0.036 |
| 0.0150000000000026 | 0.015 | 0.03 | 0.045 |
| 0.0180000000000026 | 0.018 | 0.036 | 0.054 |
| 0.0210000000000026 | 0.021 | 0.042 | 0.063 |
| 0.0240000000000026 | 0.024 | 0.048 | 0.072 |
| 0.0270000000000026 | 0.027 | 0.054 | 0.081 |
| 0.0300000000000026 | 0.03 | 0.06 | 0.09 |
| 0.0330000000000026 | 0.033 | 0.066 | 0.099 |
| 0.0360000000000026 | 0.036 | 0.072 | 0.108 |
| 0.0390000000000026 | 0.039 | 0.078 | 0.116 |
| 0.0420000000000026 | 0.042 | 0.084 | 0.125 |
| 0.0450000000000026 | 0.045 | 0.09 | 0.134 |
| 0.0480000000000026 | 0.048 | 0.096 | 0.143 |
| 0.0510000000000026 | 0.051 | 0.102 | 0.152 |
| 0.0540000000000026 | 0.054 | 0.108 | 0.161 |
| 0.0570000000000026 | 0.057 | 0.114 | 0.169 |
| 0.0600000000000026 | 0.06 | 0.119 | 0.178 |
| 0.0630000000000026 | 0.063 | 0.125 | 0.187 |
| 0.0660000000000026 | 0.066 | 0.131 | 0.195 |
| 0.0690000000000026 | 0.069 | 0.137 | 0.204 |
| 0.0720000000000027 | 0.072 | 0.143 | 0.213 |
| 0.0750000000000027 | 0.075 | 0.149 | 0.221 |
| 0.0780000000000027 | 0.078 | 0.155 | 0.23 |
| 0.0810000000000027 | 0.081 | 0.161 | 0.238 |
| 0.0840000000000027 | 0.084 | 0.166 | 0.247 |
| 0.0870000000000027 | 0.087 | 0.172 | 0.255 |
| 0.0900000000000027 | 0.09 | 0.178 | 0.264 |
| 0.0930000000000027 | 0.093 | 0.184 | 0.272 |
| 0.0960000000000027 | 0.096 | 0.19 | 0.28 |
| 0.0990000000000027 | 0.099 | 0.195 | 0.289 |
| 0.102000000000003 | 0.102 | 0.201 | 0.297 |
| 0.105000000000003 | 0.105 | 0.207 | 0.305 |
| 0.108000000000003 | 0.108 | 0.213 | 0.313 |
| 0.111000000000003 | 0.111 | 0.218 | 0.321 |
| 0.114000000000003 | 0.114 | 0.224 | 0.33 |
| 0.117000000000003 | 0.116 | 0.23 | 0.338 |
| 0.120000000000003 | 0.119 | 0.236 | 0.346 |
| 0.123000000000003 | 0.122 | 0.241 | 0.354 |
| 0.126000000000003 | 0.125 | 0.247 | 0.361 |
| 0.129000000000003 | 0.128 | 0.252 | 0.369 |
| 0.132000000000003 | 0.131 | 0.258 | 0.377 |
| 0.135000000000003 | 0.134 | 0.264 | 0.385 |
| 0.138000000000003 | 0.137 | 0.269 | 0.393 |
| 0.141000000000003 | 0.14 | 0.275 | 0.4 |
| 0.144000000000003 | 0.143 | 0.28 | 0.408 |
| 0.147000000000003 | 0.146 | 0.286 | 0.415 |
| 0.150000000000003 | 0.149 | 0.291 | 0.423 |
| 0.153000000000003 | 0.152 | 0.297 | 0.43 |
| 0.156000000000003 | 0.155 | 0.302 | 0.438 |
| 0.159000000000003 | 0.158 | 0.308 | 0.445 |
| 0.162000000000003 | 0.161 | 0.313 | 0.452 |
| 0.165000000000003 | 0.164 | 0.319 | 0.46 |
| 0.168000000000003 | 0.166 | 0.324 | 0.467 |
| 0.171000000000003 | 0.169 | 0.33 | 0.474 |
| 0.174000000000003 | 0.172 | 0.335 | 0.481 |
| 0.177000000000003 | 0.175 | 0.34 | 0.488 |
| 0.180000000000003 | 0.178 | 0.346 | 0.495 |
| 0.183000000000003 | 0.181 | 0.351 | 0.502 |
| 0.186000000000003 | 0.184 | 0.356 | 0.509 |
| 0.189000000000003 | 0.187 | 0.361 | 0.516 |
| 0.192000000000003 | 0.19 | 0.367 | 0.523 |
| 0.195000000000003 | 0.193 | 0.372 | 0.529 |
| 0.198000000000003 | 0.195 | 0.377 | 0.536 |
| 0.201000000000003 | 0.198 | 0.382 | 0.543 |
| 0.204000000000003 | 0.201 | 0.387 | 0.549 |
| 0.207000000000003 | 0.204 | 0.393 | 0.556 |
| 0.210000000000003 | 0.207 | 0.398 | 0.562 |
| 0.213000000000003 | 0.21 | 0.403 | 0.569 |
| 0.216000000000003 | 0.213 | 0.408 | 0.575 |
| 0.219000000000003 | 0.216 | 0.413 | 0.581 |
| 0.222000000000003 | 0.218 | 0.418 | 0.588 |
| 0.225000000000003 | 0.221 | 0.423 | 0.594 |
| 0.228000000000003 | 0.224 | 0.428 | 0.6 |
| 0.231000000000003 | 0.227 | 0.433 | 0.606 |
| 0.234000000000003 | 0.23 | 0.438 | 0.612 |
| 0.237000000000003 | 0.233 | 0.443 | 0.618 |
| 0.240000000000003 | 0.236 | 0.448 | 0.624 |
| 0.243000000000003 | 0.238 | 0.452 | 0.63 |
| 0.246000000000003 | 0.241 | 0.457 | 0.636 |
| 0.249000000000003 | 0.244 | 0.462 | 0.642 |
| 0.252000000000003 | 0.247 | 0.467 | 0.647 |
| 0.255000000000003 | 0.25 | 0.472 | 0.653 |
| 0.258000000000003 | 0.252 | 0.476 | 0.659 |
| 0.261000000000003 | 0.255 | 0.481 | 0.664 |
| 0.264000000000003 | 0.258 | 0.486 | 0.67 |
| 0.267000000000003 | 0.261 | 0.49 | 0.675 |
| 0.270000000000003 | 0.264 | 0.495 | 0.681 |
| 0.273000000000003 | 0.267 | 0.5 | 0.686 |
| 0.276000000000003 | 0.269 | 0.504 | 0.692 |
| 0.279000000000003 | 0.272 | 0.509 | 0.697 |
| 0.282000000000003 | 0.275 | 0.514 | 0.702 |
| 0.285000000000003 | 0.278 | 0.518 | 0.707 |
| 0.288000000000003 | 0.28 | 0.523 | 0.713 |
| 0.291000000000003 | 0.283 | 0.527 | 0.718 |
| 0.294000000000003 | 0.286 | 0.532 | 0.723 |
| 0.297000000000003 | 0.289 | 0.536 | 0.728 |
| 0.300000000000003 | 0.291 | 0.54 | 0.733 |
| 0.303000000000003 | 0.294 | 0.545 | 0.738 |
| 0.306000000000003 | 0.297 | 0.549 | 0.743 |
| 0.309000000000003 | 0.3 | 0.554 | 0.748 |
| 0.312000000000003 | 0.302 | 0.558 | 0.752 |
| 0.315000000000003 | 0.305 | 0.562 | 0.757 |
| 0.318000000000003 | 0.308 | 0.566 | 0.762 |
| 0.321000000000003 | 0.311 | 0.571 | 0.767 |
| 0.324000000000003 | 0.313 | 0.575 | 0.771 |
| 0.327000000000003 | 0.316 | 0.579 | 0.776 |
| 0.330000000000003 | 0.319 | 0.583 | 0.78 |
| 0.333000000000003 | 0.321 | 0.588 | 0.785 |
| 0.336000000000003 | 0.324 | 0.592 | 0.789 |
| 0.339000000000003 | 0.327 | 0.596 | 0.794 |
| 0.342000000000003 | 0.33 | 0.6 | 0.798 |
| 0.345000000000003 | 0.332 | 0.604 | 0.803 |
| 0.348000000000003 | 0.335 | 0.608 | 0.807 |
| 0.351000000000003 | 0.338 | 0.612 | 0.811 |
| 0.354000000000003 | 0.34 | 0.616 | 0.815 |
| 0.357000000000003 | 0.343 | 0.62 | 0.82 |
| 0.360000000000003 | 0.346 | 0.624 | 0.824 |
| 0.363000000000003 | 0.348 | 0.628 | 0.828 |
| 0.366000000000003 | 0.351 | 0.632 | 0.832 |
| 0.369000000000003 | 0.354 | 0.636 | 0.836 |
| 0.372000000000003 | 0.356 | 0.64 | 0.84 |
| 0.375000000000003 | 0.359 | 0.644 | 0.844 |
| 0.378000000000003 | 0.361 | 0.647 | 0.848 |
| 0.381000000000003 | 0.364 | 0.651 | 0.852 |
| 0.384000000000003 | 0.367 | 0.655 | 0.856 |
| 0.387000000000003 | 0.369 | 0.659 | 0.86 |
| 0.390000000000003 | 0.372 | 0.662 | 0.864 |
| 0.393000000000003 | 0.374 | 0.666 | 0.867 |
| 0.396000000000003 | 0.377 | 0.67 | 0.871 |
| 0.399000000000003 | 0.38 | 0.674 | 0.875 |
| 0.402000000000003 | 0.382 | 0.677 | 0.879 |
| 0.405000000000003 | 0.385 | 0.681 | 0.882 |
| 0.408000000000003 | 0.387 | 0.684 | 0.886 |
| 0.411000000000003 | 0.39 | 0.688 | 0.889 |
| 0.414000000000003 | 0.393 | 0.692 | 0.893 |
| 0.417000000000003 | 0.395 | 0.695 | 0.896 |
| 0.420000000000003 | 0.398 | 0.699 | 0.9 |
| 0.423000000000003 | 0.4 | 0.702 | 0.903 |
| 0.426000000000003 | 0.403 | 0.706 | 0.907 |
| 0.429000000000003 | 0.405 | 0.709 | 0.91 |
| 0.432000000000003 | 0.408 | 0.713 | 0.914 |
| 0.435000000000003 | 0.41 | 0.716 | 0.917 |
| 0.438000000000003 | 0.413 | 0.719 | 0.92 |
| 0.441000000000003 | 0.415 | 0.723 | 0.924 |
| 0.444000000000003 | 0.418 | 0.726 | 0.927 |
| 0.447000000000003 | 0.42 | 0.729 | 0.93 |
| 0.450000000000003 | 0.423 | 0.733 | 0.933 |
| 0.453000000000003 | 0.425 | 0.736 | 0.936 |
| 0.456000000000003 | 0.428 | 0.739 | 0.94 |
| 0.459000000000003 | 0.43 | 0.743 | 0.943 |
| 0.462000000000003 | 0.433 | 0.746 | 0.946 |
| 0.465000000000003 | 0.435 | 0.749 | 0.949 |
| 0.468000000000003 | 0.438 | 0.752 | 0.952 |
| 0.471000000000003 | 0.44 | 0.756 | 0.955 |
| 0.474000000000003 | 0.443 | 0.759 | 0.958 |
| 0.477000000000003 | 0.445 | 0.762 | 0.961 |
| 0.480000000000003 | 0.448 | 0.765 | 0.964 |
| 0.483000000000003 | 0.45 | 0.768 | 0.967 |
| 0.486000000000003 | 0.452 | 0.771 | 0.97 |
| 0.489000000000003 | 0.455 | 0.774 | 0.972 |
| 0.492000000000003 | 0.457 | 0.777 | 0.975 |
| 0.495000000000003 | 0.46 | 0.78 | 0.978 |
| 0.498000000000003 | 0.462 | 0.783 | 0.981 |
| 0.501000000000003 | 0.464 | 0.786 | 0.984 |
| 0.504000000000003 | 0.467 | 0.789 | 0.986 |
| 0.507000000000003 | 0.469 | 0.792 | 0.989 |
| 0.510000000000003 | 0.472 | 0.795 | 0.992 |
| 0.513000000000003 | 0.474 | 0.798 | 0.995 |
| 0.516000000000003 | 0.476 | 0.801 | 0.997 |
| 0.519000000000003 | 0.479 | 0.804 | 1 |
| 0.522000000000003 | 0.481 | 0.807 | 1.002 |
| 0.525000000000003 | 0.483 | 0.81 | 1.005 |
| 0.528000000000003 | 0.486 | 0.813 | 1.008 |
| 0.531000000000003 | 0.488 | 0.815 | 1.01 |
| 0.534000000000003 | 0.49 | 0.818 | 1.013 |
| 0.537000000000003 | 0.493 | 0.821 | 1.015 |
| 0.540000000000003 | 0.495 | 0.824 | 1.018 |
| 0.543000000000003 | 0.497 | 0.827 | 1.02 |
| 0.546000000000003 | 0.5 | 0.829 | 1.023 |
| 0.549000000000003 | 0.502 | 0.832 | 1.025 |
| 0.552000000000003 | 0.504 | 0.835 | 1.028 |
| 0.555000000000003 | 0.507 | 0.837 | 1.03 |
| 0.558000000000003 | 0.509 | 0.84 | 1.032 |
| 0.561000000000003 | 0.511 | 0.843 | 1.035 |
| 0.564000000000003 | 0.514 | 0.845 | 1.037 |
| 0.567000000000003 | 0.516 | 0.848 | 1.039 |
| 0.570000000000003 | 0.518 | 0.851 | 1.042 |
| 0.573000000000003 | 0.52 | 0.853 | 1.044 |
| 0.576000000000003 | 0.523 | 0.856 | 1.046 |
| 0.579000000000003 | 0.525 | 0.858 | 1.048 |
| 0.582000000000003 | 0.527 | 0.861 | 1.051 |
| 0.585000000000003 | 0.529 | 0.864 | 1.053 |
| 0.588000000000003 | 0.532 | 0.866 | 1.055 |
| 0.591000000000003 | 0.534 | 0.869 | 1.057 |
| 0.594000000000003 | 0.536 | 0.871 | 1.059 |
| 0.597000000000003 | 0.538 | 0.874 | 1.062 |
| 0.600000000000003 | 0.54 | 0.876 | 1.064 |
| 0.603000000000003 | 0.543 | 0.879 | 1.066 |
| 0.606000000000003 | 0.545 | 0.881 | 1.068 |
| 0.609000000000003 | 0.547 | 0.883 | 1.07 |
| 0.612000000000003 | 0.549 | 0.886 | 1.072 |
| 0.615000000000003 | 0.551 | 0.888 | 1.074 |
| 0.618000000000003 | 0.554 | 0.891 | 1.076 |
| 0.621000000000003 | 0.556 | 0.893 | 1.078 |
| 0.624000000000003 | 0.558 | 0.895 | 1.08 |
| 0.627000000000003 | 0.56 | 0.898 | 1.082 |
| 0.630000000000003 | 0.562 | 0.9 | 1.084 |
| 0.633000000000003 | 0.564 | 0.902 | 1.086 |
| 0.636000000000003 | 0.566 | 0.905 | 1.088 |
| 0.639000000000003 | 0.569 | 0.907 | 1.09 |
| 0.642000000000003 | 0.571 | 0.909 | 1.092 |
| 0.645000000000003 | 0.573 | 0.911 | 1.094 |
| 0.648000000000003 | 0.575 | 0.914 | 1.096 |
| 0.651000000000003 | 0.577 | 0.916 | 1.098 |
| 0.654000000000003 | 0.579 | 0.918 | 1.099 |
| 0.657000000000003 | 0.581 | 0.92 | 1.101 |
| 0.660000000000003 | 0.583 | 0.922 | 1.103 |
| 0.663000000000003 | 0.585 | 0.925 | 1.105 |
| 0.666000000000003 | 0.588 | 0.927 | 1.107 |
| 0.669000000000003 | 0.59 | 0.929 | 1.109 |
| 0.672000000000003 | 0.592 | 0.931 | 1.11 |
| 0.675000000000003 | 0.594 | 0.933 | 1.112 |
| 0.678000000000003 | 0.596 | 0.935 | 1.114 |
| 0.681000000000003 | 0.598 | 0.937 | 1.116 |
| 0.684000000000003 | 0.6 | 0.94 | 1.117 |
| 0.687000000000003 | 0.602 | 0.942 | 1.119 |
| 0.690000000000003 | 0.604 | 0.944 | 1.121 |
| 0.693000000000003 | 0.606 | 0.946 | 1.122 |
| 0.696000000000003 | 0.608 | 0.948 | 1.124 |
| 0.699000000000003 | 0.61 | 0.95 | 1.126 |
| 0.702000000000003 | 0.612 | 0.952 | 1.127 |
| 0.705000000000003 | 0.614 | 0.954 | 1.129 |
| 0.708000000000003 | 0.616 | 0.956 | 1.131 |
| 0.711000000000003 | 0.618 | 0.958 | 1.132 |
| 0.714000000000003 | 0.62 | 0.96 | 1.134 |
| 0.717000000000003 | 0.622 | 0.962 | 1.136 |
| 0.720000000000003 | 0.624 | 0.964 | 1.137 |
| 0.723000000000003 | 0.626 | 0.966 | 1.139 |
| 0.726000000000003 | 0.628 | 0.968 | 1.14 |
| 0.729000000000003 | 0.63 | 0.97 | 1.142 |
| 0.732000000000003 | 0.632 | 0.972 | 1.143 |
| 0.735000000000003 | 0.634 | 0.973 | 1.145 |
| 0.738000000000003 | 0.636 | 0.975 | 1.147 |
| 0.741000000000003 | 0.638 | 0.977 | 1.148 |
| 0.744000000000003 | 0.64 | 0.979 | 1.15 |
| 0.747000000000003 | 0.642 | 0.981 | 1.151 |
| 0.750000000000003 | 0.644 | 0.983 | 1.153 |
| 0.753000000000003 | 0.645 | 0.985 | 1.154 |
| 0.756000000000003 | 0.647 | 0.986 | 1.156 |
| 0.759000000000003 | 0.649 | 0.988 | 1.157 |
| 0.762000000000003 | 0.651 | 0.99 | 1.158 |
| 0.765000000000003 | 0.653 | 0.992 | 1.16 |
| 0.768000000000003 | 0.655 | 0.994 | 1.161 |
| 0.771000000000003 | 0.657 | 0.995 | 1.163 |
| 0.774000000000003 | 0.659 | 0.997 | 1.164 |
| 0.777000000000003 | 0.661 | 0.999 | 1.166 |
| 0.780000000000003 | 0.662 | 1.001 | 1.167 |
| 0.783000000000003 | 0.664 | 1.002 | 1.168 |
| 0.786000000000003 | 0.666 | 1.004 | 1.17 |
| 0.789000000000003 | 0.668 | 1.006 | 1.171 |
| 0.792000000000003 | 0.67 | 1.008 | 1.172 |
| 0.795000000000003 | 0.672 | 1.009 | 1.174 |
| 0.798000000000003 | 0.674 | 1.011 | 1.175 |
| 0.801000000000003 | 0.675 | 1.013 | 1.176 |
| 0.804000000000003 | 0.677 | 1.014 | 1.178 |
| 0.807000000000003 | 0.679 | 1.016 | 1.179 |
| 0.810000000000003 | 0.681 | 1.018 | 1.18 |
| 0.813000000000003 | 0.683 | 1.019 | 1.182 |
| 0.816000000000003 | 0.684 | 1.021 | 1.183 |
| 0.819000000000003 | 0.686 | 1.023 | 1.184 |
| 0.822000000000003 | 0.688 | 1.024 | 1.186 |
| 0.825000000000003 | 0.69 | 1.026 | 1.187 |
| 0.828000000000003 | 0.692 | 1.028 | 1.188 |
| 0.831000000000003 | 0.693 | 1.029 | 1.189 |
| 0.834000000000003 | 0.695 | 1.031 | 1.191 |
| 0.837000000000003 | 0.697 | 1.032 | 1.192 |
| 0.840000000000003 | 0.699 | 1.034 | 1.193 |
| 0.843000000000003 | 0.7 | 1.035 | 1.194 |
| 0.846000000000003 | 0.702 | 1.037 | 1.195 |
| 0.849000000000003 | 0.704 | 1.039 | 1.197 |
| 0.852000000000003 | 0.706 | 1.04 | 1.198 |
| 0.855000000000003 | 0.707 | 1.042 | 1.199 |
| 0.858000000000003 | 0.709 | 1.043 | 1.2 |
| 0.861000000000003 | 0.711 | 1.045 | 1.201 |
| 0.864000000000003 | 0.713 | 1.046 | 1.203 |
| 0.867000000000003 | 0.714 | 1.048 | 1.204 |
| 0.870000000000003 | 0.716 | 1.049 | 1.205 |
| 0.873000000000003 | 0.718 | 1.051 | 1.206 |
| 0.876000000000003 | 0.719 | 1.052 | 1.207 |
| 0.879000000000003 | 0.721 | 1.054 | 1.208 |
| 0.882000000000003 | 0.723 | 1.055 | 1.209 |
| 0.885000000000003 | 0.724 | 1.057 | 1.211 |
| 0.888000000000003 | 0.726 | 1.058 | 1.212 |
| 0.891000000000003 | 0.728 | 1.059 | 1.213 |
| 0.894000000000003 | 0.729 | 1.061 | 1.214 |
| 0.897000000000003 | 0.731 | 1.062 | 1.215 |
| 0.900000000000003 | 0.733 | 1.064 | 1.216 |
| 0.903000000000003 | 0.734 | 1.065 | 1.217 |
| 0.906000000000003 | 0.736 | 1.067 | 1.218 |
| 0.909000000000003 | 0.738 | 1.068 | 1.219 |
| 0.912000000000003 | 0.739 | 1.069 | 1.22 |
| 0.915000000000003 | 0.741 | 1.071 | 1.221 |
| 0.918000000000003 | 0.743 | 1.072 | 1.222 |
| 0.921000000000003 | 0.744 | 1.073 | 1.224 |
| 0.924000000000003 | 0.746 | 1.075 | 1.225 |
| 0.927000000000003 | 0.748 | 1.076 | 1.226 |
| 0.930000000000003 | 0.749 | 1.077 | 1.227 |
| 0.933000000000003 | 0.751 | 1.079 | 1.228 |
| 0.936000000000003 | 0.752 | 1.08 | 1.229 |
| 0.939000000000003 | 0.754 | 1.082 | 1.23 |
| 0.942000000000003 | 0.756 | 1.083 | 1.231 |
| 0.945000000000003 | 0.757 | 1.084 | 1.232 |
| 0.948000000000003 | 0.759 | 1.085 | 1.233 |
| 0.951000000000003 | 0.76 | 1.087 | 1.234 |
| 0.954000000000003 | 0.762 | 1.088 | 1.235 |
| 0.957000000000003 | 0.763 | 1.089 | 1.236 |
| 0.960000000000003 | 0.765 | 1.091 | 1.237 |
| 0.963000000000003 | 0.767 | 1.092 | 1.238 |
| 0.966000000000003 | 0.768 | 1.093 | 1.239 |
| 0.969000000000003 | 0.77 | 1.094 | 1.239 |
| 0.972000000000003 | 0.771 | 1.096 | 1.24 |
| 0.975000000000003 | 0.773 | 1.097 | 1.241 |
| 0.978000000000003 | 0.774 | 1.098 | 1.242 |
| 0.981000000000003 | 0.776 | 1.099 | 1.243 |
| 0.984000000000003 | 0.777 | 1.101 | 1.244 |
| 0.987000000000003 | 0.779 | 1.102 | 1.245 |
| 0.990000000000003 | 0.78 | 1.103 | 1.246 |
| 0.993000000000003 | 0.782 | 1.104 | 1.247 |
| 0.996000000000003 | 0.783 | 1.106 | 1.248 |
| 0.999000000000003 | 0.785 | 1.107 | 1.249 |
| 1.002000000000003 | 0.786 | 1.108 | 1.25 |
| 1.005000000000003 | 0.788 | 1.109 | 1.251 |
| 1.008000000000003 | 0.789 | 1.11 | 1.251 |
| 1.011000000000003 | 0.791 | 1.112 | 1.252 |
| 1.014000000000003 | 0.792 | 1.113 | 1.253 |
| 1.017000000000003 | 0.794 | 1.114 | 1.254 |
| 1.020000000000003 | 0.795 | 1.115 | 1.255 |
| 1.023000000000003 | 0.797 | 1.116 | 1.256 |
| 1.026000000000002 | 0.798 | 1.117 | 1.257 |
| 1.029000000000002 | 0.8 | 1.118 | 1.258 |
| 1.032000000000002 | 0.801 | 1.12 | 1.258 |
| 1.035000000000002 | 0.803 | 1.121 | 1.259 |
| 1.038000000000002 | 0.804 | 1.122 | 1.26 |
| 1.041000000000002 | 0.805 | 1.123 | 1.261 |
| 1.044000000000002 | 0.807 | 1.124 | 1.262 |
| 1.047000000000002 | 0.808 | 1.125 | 1.263 |
| 1.050000000000002 | 0.81 | 1.126 | 1.263 |
| 1.053000000000001 | 0.811 | 1.127 | 1.264 |
| 1.056000000000001 | 0.813 | 1.129 | 1.265 |
| 1.059000000000001 | 0.814 | 1.13 | 1.266 |
| 1.062000000000001 | 0.815 | 1.131 | 1.267 |
| 1.065000000000001 | 0.817 | 1.132 | 1.267 |
| 1.068000000000001 | 0.818 | 1.133 | 1.268 |
| 1.071000000000001 | 0.82 | 1.134 | 1.269 |
| 1.074000000000001 | 0.821 | 1.135 | 1.27 |
| 1.077000000000001 | 0.822 | 1.136 | 1.271 |
| 1.08 | 0.824 | 1.137 | 1.271 |
| 1.083 | 0.825 | 1.138 | 1.272 |
| 1.086 | 0.827 | 1.139 | 1.273 |
| 1.089 | 0.828 | 1.14 | 1.274 |
| 1.092 | 0.829 | 1.141 | 1.275 |
| 1.095 | 0.831 | 1.142 | 1.275 |
| 1.098 | 0.832 | 1.143 | 1.276 |
| 1.101 | 0.833 | 1.145 | 1.277 |
| 1.104 | 0.835 | 1.146 | 1.278 |
| 1.107 | 0.836 | 1.147 | 1.278 |
| 1.109999999999999 | 0.837 | 1.148 | 1.279 |
| 1.112999999999999 | 0.839 | 1.149 | 1.28 |
| 1.115999999999999 | 0.84 | 1.15 | 1.281 |
| 1.118999999999999 | 0.841 | 1.151 | 1.281 |
| 1.121999999999999 | 0.843 | 1.152 | 1.282 |
| 1.124999999999999 | 0.844 | 1.153 | 1.283 |
| 1.127999999999999 | 0.845 | 1.154 | 1.283 |
| 1.130999999999999 | 0.847 | 1.155 | 1.284 |
| 1.133999999999999 | 0.848 | 1.156 | 1.285 |
| 1.136999999999998 | 0.849 | 1.156 | 1.286 |
| 1.139999999999998 | 0.851 | 1.157 | 1.286 |
| 1.142999999999998 | 0.852 | 1.158 | 1.287 |
| 1.145999999999998 | 0.853 | 1.159 | 1.288 |
| 1.148999999999998 | 0.855 | 1.16 | 1.288 |
| 1.151999999999998 | 0.856 | 1.161 | 1.289 |
| 1.154999999999998 | 0.857 | 1.162 | 1.29 |
| 1.157999999999998 | 0.858 | 1.163 | 1.291 |
| 1.160999999999998 | 0.86 | 1.164 | 1.291 |
| 1.163999999999997 | 0.861 | 1.165 | 1.292 |
| 1.166999999999997 | 0.862 | 1.166 | 1.293 |
| 1.169999999999997 | 0.864 | 1.167 | 1.293 |
| 1.172999999999997 | 0.865 | 1.168 | 1.294 |
| 1.175999999999997 | 0.866 | 1.169 | 1.295 |
| 1.178999999999997 | 0.867 | 1.17 | 1.295 |
| 1.181999999999997 | 0.869 | 1.171 | 1.296 |
| 1.184999999999997 | 0.87 | 1.172 | 1.297 |
| 1.187999999999997 | 0.871 | 1.172 | 1.297 |
| 1.190999999999996 | 0.872 | 1.173 | 1.298 |
| 1.193999999999996 | 0.874 | 1.174 | 1.299 |
| 1.196999999999996 | 0.875 | 1.175 | 1.299 |
| 1.199999999999996 | 0.876 | 1.176 | 1.3 |
| 1.202999999999996 | 0.877 | 1.177 | 1.3 |
| 1.205999999999996 | 0.879 | 1.178 | 1.301 |
| 1.208999999999996 | 0.88 | 1.179 | 1.302 |
| 1.211999999999996 | 0.881 | 1.18 | 1.302 |
| 1.214999999999996 | 0.882 | 1.18 | 1.303 |
| 1.217999999999996 | 0.883 | 1.181 | 1.304 |
| 1.220999999999995 | 0.885 | 1.182 | 1.304 |
| 1.223999999999995 | 0.886 | 1.183 | 1.305 |
| 1.226999999999995 | 0.887 | 1.184 | 1.306 |
| 1.229999999999995 | 0.888 | 1.185 | 1.306 |
| 1.232999999999995 | 0.889 | 1.186 | 1.307 |
| 1.235999999999995 | 0.891 | 1.186 | 1.307 |
| 1.238999999999995 | 0.892 | 1.187 | 1.308 |
| 1.241999999999995 | 0.893 | 1.188 | 1.309 |
| 1.244999999999995 | 0.894 | 1.189 | 1.309 |
| 1.247999999999994 | 0.895 | 1.19 | 1.31 |
| 1.250999999999994 | 0.896 | 1.191 | 1.31 |
| 1.253999999999994 | 0.898 | 1.191 | 1.311 |
| 1.256999999999994 | 0.899 | 1.192 | 1.312 |
| 1.259999999999994 | 0.9 | 1.193 | 1.312 |
| 1.262999999999994 | 0.901 | 1.194 | 1.313 |
| 1.265999999999994 | 0.902 | 1.195 | 1.313 |
| 1.268999999999994 | 0.903 | 1.195 | 1.314 |
| 1.271999999999994 | 0.905 | 1.196 | 1.315 |
| 1.274999999999993 | 0.906 | 1.197 | 1.315 |
| 1.277999999999993 | 0.907 | 1.198 | 1.316 |
| 1.280999999999993 | 0.908 | 1.199 | 1.316 |
| 1.283999999999993 | 0.909 | 1.199 | 1.317 |
| 1.286999999999993 | 0.91 | 1.2 | 1.317 |
| 1.289999999999993 | 0.911 | 1.201 | 1.318 |
| 1.292999999999993 | 0.912 | 1.202 | 1.318 |
| 1.295999999999993 | 0.914 | 1.203 | 1.319 |
| 1.298999999999993 | 0.915 | 1.203 | 1.32 |
| 1.301999999999992 | 0.916 | 1.204 | 1.32 |
| 1.304999999999992 | 0.917 | 1.205 | 1.321 |
| 1.307999999999992 | 0.918 | 1.206 | 1.321 |
| 1.310999999999992 | 0.919 | 1.206 | 1.322 |
| 1.313999999999992 | 0.92 | 1.207 | 1.322 |
| 1.316999999999992 | 0.921 | 1.208 | 1.323 |
| 1.319999999999992 | 0.922 | 1.209 | 1.323 |
| 1.322999999999992 | 0.924 | 1.209 | 1.324 |
| 1.325999999999992 | 0.925 | 1.21 | 1.325 |
| 1.328999999999991 | 0.926 | 1.211 | 1.325 |
| 1.331999999999991 | 0.927 | 1.212 | 1.326 |
| 1.334999999999991 | 0.928 | 1.212 | 1.326 |
| 1.337999999999991 | 0.929 | 1.213 | 1.327 |
| 1.340999999999991 | 0.93 | 1.214 | 1.327 |
| 1.343999999999991 | 0.931 | 1.215 | 1.328 |
| 1.346999999999991 | 0.932 | 1.215 | 1.328 |
| 1.349999999999991 | 0.933 | 1.216 | 1.329 |
| 1.352999999999991 | 0.934 | 1.217 | 1.329 |
| 1.35599999999999 | 0.935 | 1.218 | 1.33 |
| 1.35899999999999 | 0.936 | 1.218 | 1.33 |
| 1.36199999999999 | 0.937 | 1.219 | 1.331 |
| 1.36499999999999 | 0.939 | 1.22 | 1.331 |
| 1.36799999999999 | 0.94 | 1.22 | 1.332 |
| 1.37099999999999 | 0.941 | 1.221 | 1.332 |
| 1.37399999999999 | 0.942 | 1.222 | 1.333 |
| 1.37699999999999 | 0.943 | 1.222 | 1.333 |
| 1.37999999999999 | 0.944 | 1.223 | 1.334 |
| 1.38299999999999 | 0.945 | 1.224 | 1.334 |
| 1.385999999999989 | 0.946 | 1.225 | 1.335 |
| 1.388999999999989 | 0.947 | 1.225 | 1.335 |
| 1.391999999999989 | 0.948 | 1.226 | 1.336 |
| 1.394999999999989 | 0.949 | 1.227 | 1.336 |
| 1.397999999999989 | 0.95 | 1.227 | 1.337 |
| 1.400999999999989 | 0.951 | 1.228 | 1.337 |
| 1.403999999999989 | 0.952 | 1.229 | 1.338 |
| 1.406999999999989 | 0.953 | 1.229 | 1.338 |
| 1.409999999999989 | 0.954 | 1.23 | 1.339 |
| 1.412999999999988 | 0.955 | 1.231 | 1.339 |
| 1.415999999999988 | 0.956 | 1.231 | 1.34 |
| 1.418999999999988 | 0.957 | 1.232 | 1.34 |
| 1.421999999999988 | 0.958 | 1.233 | 1.341 |
| 1.424999999999988 | 0.959 | 1.233 | 1.341 |
| 1.427999999999988 | 0.96 | 1.234 | 1.341 |
| 1.430999999999988 | 0.961 | 1.235 | 1.342 |
| 1.433999999999988 | 0.962 | 1.235 | 1.342 |
| 1.436999999999988 | 0.963 | 1.236 | 1.343 |
| 1.439999999999987 | 0.964 | 1.237 | 1.343 |
| 1.442999999999987 | 0.965 | 1.237 | 1.344 |
| 1.445999999999987 | 0.966 | 1.238 | 1.344 |
| 1.448999999999987 | 0.967 | 1.239 | 1.345 |
| 1.451999999999987 | 0.968 | 1.239 | 1.345 |
| 1.454999999999987 | 0.969 | 1.24 | 1.346 |
| 1.457999999999987 | 0.97 | 1.24 | 1.346 |
| 1.460999999999987 | 0.971 | 1.241 | 1.346 |
| 1.463999999999987 | 0.972 | 1.242 | 1.347 |
| 1.466999999999987 | 0.972 | 1.242 | 1.347 |
| 1.469999999999986 | 0.973 | 1.243 | 1.348 |
| 1.472999999999986 | 0.974 | 1.244 | 1.348 |
| 1.475999999999986 | 0.975 | 1.244 | 1.349 |
| 1.478999999999986 | 0.976 | 1.245 | 1.349 |
| 1.481999999999986 | 0.977 | 1.245 | 1.35 |
| 1.484999999999986 | 0.978 | 1.246 | 1.35 |
| 1.487999999999986 | 0.979 | 1.247 | 1.35 |
| 1.490999999999986 | 0.98 | 1.247 | 1.351 |
| 1.493999999999986 | 0.981 | 1.248 | 1.351 |
| 1.496999999999985 | 0.982 | 1.248 | 1.352 |
| 1.499999999999985 | 0.983 | 1.249 | 1.352 |
| 1.502999999999985 | 0.984 | 1.25 | 1.353 |
| 1.505999999999985 | 0.985 | 1.25 | 1.353 |
| 1.508999999999985 | 0.986 | 1.251 | 1.353 |
| 1.511999999999985 | 0.986 | 1.251 | 1.354 |
| 1.514999999999985 | 0.987 | 1.252 | 1.354 |
| 1.517999999999985 | 0.988 | 1.253 | 1.355 |
| 1.520999999999985 | 0.989 | 1.253 | 1.355 |
| 1.523999999999984 | 0.99 | 1.254 | 1.355 |
| 1.526999999999984 | 0.991 | 1.254 | 1.356 |
| 1.529999999999984 | 0.992 | 1.255 | 1.356 |
| 1.532999999999984 | 0.993 | 1.256 | 1.357 |
| 1.535999999999984 | 0.994 | 1.256 | 1.357 |
| 1.538999999999984 | 0.995 | 1.257 | 1.358 |
| 1.541999999999984 | 0.995 | 1.257 | 1.358 |
| 1.544999999999984 | 0.996 | 1.258 | 1.358 |
| 1.547999999999984 | 0.997 | 1.258 | 1.359 |
| 1.550999999999983 | 0.998 | 1.259 | 1.359 |
| 1.553999999999983 | 0.999 | 1.26 | 1.359 |
| 1.556999999999983 | 1 | 1.26 | 1.36 |
| 1.559999999999983 | 1.001 | 1.261 | 1.36 |
| 1.562999999999983 | 1.002 | 1.261 | 1.361 |
| 1.565999999999983 | 1.002 | 1.262 | 1.361 |
| 1.568999999999983 | 1.003 | 1.262 | 1.361 |
| 1.571999999999983 | 1.004 | 1.263 | 1.362 |
| 1.574999999999983 | 1.005 | 1.263 | 1.362 |
| 1.577999999999983 | 1.006 | 1.264 | 1.363 |
| 1.580999999999982 | 1.007 | 1.264 | 1.363 |
| 1.583999999999982 | 1.008 | 1.265 | 1.363 |
| 1.586999999999982 | 1.009 | 1.266 | 1.364 |
| 1.589999999999982 | 1.009 | 1.266 | 1.364 |
| 1.592999999999982 | 1.01 | 1.267 | 1.365 |
| 1.595999999999982 | 1.011 | 1.267 | 1.365 |
| 1.598999999999982 | 1.012 | 1.268 | 1.365 |
| 1.601999999999982 | 1.013 | 1.268 | 1.366 |
| 1.604999999999981 | 1.014 | 1.269 | 1.366 |
| 1.607999999999981 | 1.014 | 1.269 | 1.366 |
| 1.610999999999981 | 1.015 | 1.27 | 1.367 |
| 1.613999999999981 | 1.016 | 1.27 | 1.367 |
| 1.616999999999981 | 1.017 | 1.271 | 1.368 |
| 1.619999999999981 | 1.018 | 1.271 | 1.368 |
| 1.622999999999981 | 1.019 | 1.272 | 1.368 |
| 1.625999999999981 | 1.019 | 1.272 | 1.369 |
| 1.628999999999981 | 1.02 | 1.273 | 1.369 |
| 1.63199999999998 | 1.021 | 1.274 | 1.369 |
| 1.63499999999998 | 1.022 | 1.274 | 1.37 |
| 1.63799999999998 | 1.023 | 1.275 | 1.37 |
| 1.64099999999998 | 1.024 | 1.275 | 1.37 |
| 1.64399999999998 | 1.024 | 1.276 | 1.371 |
| 1.64699999999998 | 1.025 | 1.276 | 1.371 |
| 1.64999999999998 | 1.026 | 1.277 | 1.371 |
| 1.65299999999998 | 1.027 | 1.277 | 1.372 |
| 1.65599999999998 | 1.028 | 1.278 | 1.372 |
| 1.65899999999998 | 1.028 | 1.278 | 1.373 |
| 1.661999999999979 | 1.029 | 1.279 | 1.373 |
| 1.664999999999979 | 1.03 | 1.279 | 1.373 |
| 1.667999999999979 | 1.031 | 1.28 | 1.374 |
| 1.670999999999979 | 1.032 | 1.28 | 1.374 |
| 1.673999999999979 | 1.032 | 1.281 | 1.374 |
| 1.676999999999979 | 1.033 | 1.281 | 1.375 |
| 1.679999999999979 | 1.034 | 1.282 | 1.375 |
| 1.682999999999979 | 1.035 | 1.282 | 1.375 |
| 1.685999999999979 | 1.035 | 1.282 | 1.376 |
| 1.688999999999978 | 1.036 | 1.283 | 1.376 |
| 1.691999999999978 | 1.037 | 1.283 | 1.376 |
| 1.694999999999978 | 1.038 | 1.284 | 1.377 |
| 1.697999999999978 | 1.039 | 1.284 | 1.377 |
| 1.700999999999978 | 1.039 | 1.285 | 1.377 |
| 1.703999999999978 | 1.04 | 1.285 | 1.378 |
| 1.706999999999978 | 1.041 | 1.286 | 1.378 |
| 1.709999999999978 | 1.042 | 1.286 | 1.378 |
| 1.712999999999978 | 1.042 | 1.287 | 1.379 |
| 1.715999999999977 | 1.043 | 1.287 | 1.379 |
| 1.718999999999977 | 1.044 | 1.288 | 1.379 |
| 1.721999999999977 | 1.045 | 1.288 | 1.38 |
| 1.724999999999977 | 1.045 | 1.289 | 1.38 |
| 1.727999999999977 | 1.046 | 1.289 | 1.38 |
| 1.730999999999977 | 1.047 | 1.29 | 1.381 |
| 1.733999999999977 | 1.048 | 1.29 | 1.381 |
| 1.736999999999977 | 1.048 | 1.291 | 1.381 |
| 1.739999999999977 | 1.049 | 1.291 | 1.382 |
| 1.742999999999976 | 1.05 | 1.291 | 1.382 |
| 1.745999999999976 | 1.051 | 1.292 | 1.382 |
| 1.748999999999976 | 1.051 | 1.292 | 1.382 |
| 1.751999999999976 | 1.052 | 1.293 | 1.383 |
| 1.754999999999976 | 1.053 | 1.293 | 1.383 |
| 1.757999999999976 | 1.054 | 1.294 | 1.383 |
| 1.760999999999976 | 1.054 | 1.294 | 1.384 |
| 1.763999999999976 | 1.055 | 1.295 | 1.384 |
| 1.766999999999976 | 1.056 | 1.295 | 1.384 |
| 1.769999999999976 | 1.057 | 1.295 | 1.385 |
| 1.772999999999975 | 1.057 | 1.296 | 1.385 |
| 1.775999999999975 | 1.058 | 1.296 | 1.385 |
| 1.778999999999975 | 1.059 | 1.297 | 1.386 |
| 1.781999999999975 | 1.059 | 1.297 | 1.386 |
| 1.784999999999975 | 1.06 | 1.298 | 1.386 |
| 1.787999999999975 | 1.061 | 1.298 | 1.386 |
| 1.790999999999975 | 1.062 | 1.299 | 1.387 |
| 1.793999999999975 | 1.062 | 1.299 | 1.387 |
| 1.796999999999975 | 1.063 | 1.299 | 1.387 |
| 1.799999999999974 | 1.064 | 1.3 | 1.388 |
| 1.802999999999974 | 1.064 | 1.3 | 1.388 |
| 1.805999999999974 | 1.065 | 1.301 | 1.388 |
| 1.808999999999974 | 1.066 | 1.301 | 1.389 |
| 1.811999999999974 | 1.067 | 1.302 | 1.389 |
| 1.814999999999974 | 1.067 | 1.302 | 1.389 |
| 1.817999999999974 | 1.068 | 1.302 | 1.389 |
| 1.820999999999974 | 1.069 | 1.303 | 1.39 |
| 1.823999999999974 | 1.069 | 1.303 | 1.39 |
| 1.826999999999973 | 1.07 | 1.304 | 1.39 |
| 1.829999999999973 | 1.071 | 1.304 | 1.391 |
| 1.832999999999973 | 1.071 | 1.304 | 1.391 |
| 1.835999999999973 | 1.072 | 1.305 | 1.391 |
| 1.838999999999973 | 1.073 | 1.305 | 1.391 |
| 1.841999999999973 | 1.073 | 1.306 | 1.392 |
| 1.844999999999973 | 1.074 | 1.306 | 1.392 |
| 1.847999999999973 | 1.075 | 1.307 | 1.392 |
| 1.850999999999973 | 1.075 | 1.307 | 1.393 |
| 1.853999999999973 | 1.076 | 1.307 | 1.393 |
| 1.856999999999972 | 1.077 | 1.308 | 1.393 |
| 1.859999999999972 | 1.077 | 1.308 | 1.393 |
| 1.862999999999972 | 1.078 | 1.309 | 1.394 |
| 1.865999999999972 | 1.079 | 1.309 | 1.394 |
| 1.868999999999972 | 1.08 | 1.309 | 1.394 |
| 1.871999999999972 | 1.08 | 1.31 | 1.395 |
| 1.874999999999972 | 1.081 | 1.31 | 1.395 |
| 1.877999999999972 | 1.082 | 1.311 | 1.395 |
| 1.880999999999972 | 1.082 | 1.311 | 1.395 |
| 1.883999999999971 | 1.083 | 1.311 | 1.396 |
| 1.886999999999971 | 1.083 | 1.312 | 1.396 |
| 1.889999999999971 | 1.084 | 1.312 | 1.396 |
| 1.892999999999971 | 1.085 | 1.313 | 1.396 |
| 1.895999999999971 | 1.085 | 1.313 | 1.397 |
| 1.898999999999971 | 1.086 | 1.313 | 1.397 |
| 1.901999999999971 | 1.087 | 1.314 | 1.397 |
| 1.904999999999971 | 1.087 | 1.314 | 1.398 |
| 1.907999999999971 | 1.088 | 1.315 | 1.398 |
| 1.91099999999997 | 1.089 | 1.315 | 1.398 |
| 1.91399999999997 | 1.089 | 1.315 | 1.398 |
| 1.91699999999997 | 1.09 | 1.316 | 1.399 |
| 1.91999999999997 | 1.091 | 1.316 | 1.399 |
| 1.92299999999997 | 1.091 | 1.316 | 1.399 |
| 1.92599999999997 | 1.092 | 1.317 | 1.399 |
| 1.92899999999997 | 1.093 | 1.317 | 1.4 |
| 1.93199999999997 | 1.093 | 1.318 | 1.4 |
| 1.93499999999997 | 1.094 | 1.318 | 1.4 |
| 1.937999999999969 | 1.094 | 1.318 | 1.4 |
| 1.940999999999969 | 1.095 | 1.319 | 1.401 |
| 1.943999999999969 | 1.096 | 1.319 | 1.401 |
| 1.946999999999969 | 1.096 | 1.319 | 1.401 |
| 1.949999999999969 | 1.097 | 1.32 | 1.401 |
| 1.952999999999969 | 1.098 | 1.32 | 1.402 |
| 1.955999999999969 | 1.098 | 1.321 | 1.402 |
| 1.958999999999969 | 1.099 | 1.321 | 1.402 |
| 1.961999999999969 | 1.099 | 1.321 | 1.403 |
| 1.964999999999969 | 1.1 | 1.322 | 1.403 |
| 1.967999999999968 | 1.101 | 1.322 | 1.403 |
| 1.970999999999968 | 1.101 | 1.322 | 1.403 |
| 1.973999999999968 | 1.102 | 1.323 | 1.404 |
| 1.976999999999968 | 1.103 | 1.323 | 1.404 |
| 1.979999999999968 | 1.103 | 1.323 | 1.404 |
| 1.982999999999968 | 1.104 | 1.324 | 1.404 |
| 1.985999999999968 | 1.104 | 1.324 | 1.405 |
| 1.988999999999968 | 1.105 | 1.325 | 1.405 |
| 1.991999999999968 | 1.106 | 1.325 | 1.405 |
| 1.994999999999967 | 1.106 | 1.325 | 1.405 |
| 1.997999999999967 | 1.107 | 1.326 | 1.405 |
| 2.000999999999967 | 1.107 | 1.326 | 1.406 |
| 2.003999999999968 | 1.108 | 1.326 | 1.406 |
| 2.006999999999968 | 1.109 | 1.327 | 1.406 |
| 2.009999999999968 | 1.109 | 1.327 | 1.406 |
| 2.012999999999968 | 1.11 | 1.327 | 1.407 |
| 2.015999999999968 | 1.11 | 1.328 | 1.407 |
| 2.018999999999968 | 1.111 | 1.328 | 1.407 |
| 2.021999999999968 | 1.112 | 1.328 | 1.407 |
| 2.024999999999968 | 1.112 | 1.329 | 1.408 |
| 2.027999999999968 | 1.113 | 1.329 | 1.408 |
| 2.030999999999969 | 1.113 | 1.329 | 1.408 |
| 2.033999999999969 | 1.114 | 1.33 | 1.408 |
| 2.036999999999969 | 1.114 | 1.33 | 1.409 |
| 2.039999999999969 | 1.115 | 1.33 | 1.409 |
| 2.042999999999969 | 1.116 | 1.331 | 1.409 |
| 2.045999999999969 | 1.116 | 1.331 | 1.409 |
| 2.048999999999969 | 1.117 | 1.331 | 1.41 |
| 2.051999999999969 | 1.117 | 1.332 | 1.41 |
| 2.05499999999997 | 1.118 | 1.332 | 1.41 |
| 2.05799999999997 | 1.118 | 1.332 | 1.41 |
| 2.06099999999997 | 1.119 | 1.333 | 1.41 |
| 2.06399999999997 | 1.12 | 1.333 | 1.411 |
| 2.06699999999997 | 1.12 | 1.333 | 1.411 |
| 2.06999999999997 | 1.121 | 1.334 | 1.411 |
| 2.07299999999997 | 1.121 | 1.334 | 1.411 |
| 2.07599999999997 | 1.122 | 1.334 | 1.412 |
| 2.07899999999997 | 1.122 | 1.335 | 1.412 |
| 2.081999999999971 | 1.123 | 1.335 | 1.412 |
| 2.084999999999971 | 1.124 | 1.335 | 1.412 |
| 2.087999999999971 | 1.124 | 1.336 | 1.412 |
| 2.090999999999971 | 1.125 | 1.336 | 1.413 |
| 2.093999999999971 | 1.125 | 1.336 | 1.413 |
| 2.096999999999971 | 1.126 | 1.337 | 1.413 |
| 2.099999999999971 | 1.126 | 1.337 | 1.413 |
| 2.102999999999971 | 1.127 | 1.337 | 1.414 |
| 2.105999999999971 | 1.127 | 1.338 | 1.414 |
| 2.108999999999972 | 1.128 | 1.338 | 1.414 |
| 2.111999999999972 | 1.129 | 1.338 | 1.414 |
| 2.114999999999972 | 1.129 | 1.339 | 1.414 |
| 2.117999999999972 | 1.13 | 1.339 | 1.415 |
| 2.120999999999972 | 1.13 | 1.339 | 1.415 |
| 2.123999999999972 | 1.131 | 1.34 | 1.415 |
| 2.126999999999972 | 1.131 | 1.34 | 1.415 |
| 2.129999999999972 | 1.132 | 1.34 | 1.416 |
| 2.132999999999972 | 1.132 | 1.341 | 1.416 |
| 2.135999999999973 | 1.133 | 1.341 | 1.416 |
| 2.138999999999973 | 1.133 | 1.341 | 1.416 |
| 2.141999999999973 | 1.134 | 1.341 | 1.416 |
| 2.144999999999973 | 1.135 | 1.342 | 1.417 |
| 2.147999999999973 | 1.135 | 1.342 | 1.417 |
| 2.150999999999973 | 1.136 | 1.342 | 1.417 |
| 2.153999999999973 | 1.136 | 1.343 | 1.417 |
| 2.156999999999973 | 1.137 | 1.343 | 1.417 |
| 2.159999999999973 | 1.137 | 1.343 | 1.418 |
| 2.162999999999974 | 1.138 | 1.344 | 1.418 |
| 2.165999999999974 | 1.138 | 1.344 | 1.418 |
| 2.168999999999974 | 1.139 | 1.344 | 1.418 |
| 2.171999999999974 | 1.139 | 1.345 | 1.419 |
| 2.174999999999974 | 1.14 | 1.345 | 1.419 |
| 2.177999999999974 | 1.14 | 1.345 | 1.419 |
| 2.180999999999974 | 1.141 | 1.345 | 1.419 |
| 2.183999999999974 | 1.141 | 1.346 | 1.419 |
| 2.186999999999974 | 1.142 | 1.346 | 1.42 |
| 2.189999999999975 | 1.142 | 1.346 | 1.42 |
| 2.192999999999975 | 1.143 | 1.347 | 1.42 |
| 2.195999999999975 | 1.143 | 1.347 | 1.42 |
| 2.198999999999975 | 1.144 | 1.347 | 1.42 |
| 2.201999999999975 | 1.145 | 1.348 | 1.421 |
| 2.204999999999975 | 1.145 | 1.348 | 1.421 |
| 2.207999999999975 | 1.146 | 1.348 | 1.421 |
| 2.210999999999975 | 1.146 | 1.348 | 1.421 |
| 2.213999999999976 | 1.147 | 1.349 | 1.421 |
| 2.216999999999976 | 1.147 | 1.349 | 1.422 |
| 2.219999999999976 | 1.148 | 1.349 | 1.422 |
| 2.222999999999976 | 1.148 | 1.35 | 1.422 |
| 2.225999999999976 | 1.149 | 1.35 | 1.422 |
| 2.228999999999976 | 1.149 | 1.35 | 1.422 |
| 2.231999999999976 | 1.15 | 1.35 | 1.423 |
| 2.234999999999976 | 1.15 | 1.351 | 1.423 |
| 2.237999999999976 | 1.151 | 1.351 | 1.423 |
| 2.240999999999976 | 1.151 | 1.351 | 1.423 |
| 2.243999999999976 | 1.152 | 1.352 | 1.423 |
| 2.246999999999977 | 1.152 | 1.352 | 1.424 |
| 2.249999999999977 | 1.153 | 1.352 | 1.424 |
| 2.252999999999977 | 1.153 | 1.352 | 1.424 |
| 2.255999999999977 | 1.154 | 1.353 | 1.424 |
| 2.258999999999977 | 1.154 | 1.353 | 1.424 |
| 2.261999999999977 | 1.155 | 1.353 | 1.424 |
| 2.264999999999977 | 1.155 | 1.354 | 1.425 |
| 2.267999999999977 | 1.156 | 1.354 | 1.425 |
| 2.270999999999978 | 1.156 | 1.354 | 1.425 |
| 2.273999999999978 | 1.156 | 1.354 | 1.425 |
| 2.276999999999978 | 1.157 | 1.355 | 1.425 |
| 2.279999999999978 | 1.157 | 1.355 | 1.426 |
| 2.282999999999978 | 1.158 | 1.355 | 1.426 |
| 2.285999999999978 | 1.158 | 1.355 | 1.426 |
| 2.288999999999978 | 1.159 | 1.356 | 1.426 |
| 2.291999999999978 | 1.159 | 1.356 | 1.426 |
| 2.294999999999979 | 1.16 | 1.356 | 1.427 |
| 2.297999999999979 | 1.16 | 1.357 | 1.427 |
| 2.300999999999979 | 1.161 | 1.357 | 1.427 |
| 2.303999999999979 | 1.161 | 1.357 | 1.427 |
| 2.306999999999979 | 1.162 | 1.357 | 1.427 |
| 2.309999999999979 | 1.162 | 1.358 | 1.427 |
| 2.312999999999979 | 1.163 | 1.358 | 1.428 |
| 2.315999999999979 | 1.163 | 1.358 | 1.428 |
| 2.318999999999979 | 1.164 | 1.358 | 1.428 |
| 2.32199999999998 | 1.164 | 1.359 | 1.428 |
| 2.32499999999998 | 1.165 | 1.359 | 1.428 |
| 2.32799999999998 | 1.165 | 1.359 | 1.429 |
| 2.33099999999998 | 1.166 | 1.359 | 1.429 |
| 2.33399999999998 | 1.166 | 1.36 | 1.429 |
| 2.33699999999998 | 1.166 | 1.36 | 1.429 |
| 2.33999999999998 | 1.167 | 1.36 | 1.429 |
| 2.34299999999998 | 1.167 | 1.361 | 1.429 |
| 2.34599999999998 | 1.168 | 1.361 | 1.43 |
| 2.348999999999981 | 1.168 | 1.361 | 1.43 |
| 2.351999999999981 | 1.169 | 1.361 | 1.43 |
| 2.354999999999981 | 1.169 | 1.362 | 1.43 |
| 2.357999999999981 | 1.17 | 1.362 | 1.43 |
| 2.360999999999981 | 1.17 | 1.362 | 1.431 |
| 2.363999999999981 | 1.171 | 1.362 | 1.431 |
| 2.366999999999981 | 1.171 | 1.363 | 1.431 |
| 2.369999999999981 | 1.172 | 1.363 | 1.431 |
| 2.372999999999982 | 1.172 | 1.363 | 1.431 |
| 2.375999999999982 | 1.172 | 1.363 | 1.431 |
| 2.378999999999982 | 1.173 | 1.364 | 1.432 |
| 2.381999999999982 | 1.173 | 1.364 | 1.432 |
| 2.384999999999982 | 1.174 | 1.364 | 1.432 |
| 2.387999999999982 | 1.174 | 1.364 | 1.432 |
| 2.390999999999982 | 1.175 | 1.365 | 1.432 |
| 2.393999999999982 | 1.175 | 1.365 | 1.432 |
| 2.396999999999982 | 1.176 | 1.365 | 1.433 |
| 2.399999999999983 | 1.176 | 1.365 | 1.433 |
| 2.402999999999983 | 1.176 | 1.366 | 1.433 |
| 2.405999999999983 | 1.177 | 1.366 | 1.433 |
| 2.408999999999983 | 1.177 | 1.366 | 1.433 |
| 2.411999999999983 | 1.178 | 1.366 | 1.433 |
| 2.414999999999983 | 1.178 | 1.367 | 1.434 |
| 2.417999999999983 | 1.179 | 1.367 | 1.434 |
| 2.420999999999983 | 1.179 | 1.367 | 1.434 |
| 2.423999999999983 | 1.18 | 1.367 | 1.434 |
| 2.426999999999984 | 1.18 | 1.368 | 1.434 |
| 2.429999999999984 | 1.18 | 1.368 | 1.434 |
| 2.432999999999984 | 1.181 | 1.368 | 1.435 |
| 2.435999999999984 | 1.181 | 1.368 | 1.435 |
| 2.438999999999984 | 1.182 | 1.369 | 1.435 |
| 2.441999999999984 | 1.182 | 1.369 | 1.435 |
| 2.444999999999984 | 1.183 | 1.369 | 1.435 |
| 2.447999999999984 | 1.183 | 1.369 | 1.435 |
| 2.450999999999984 | 1.183 | 1.37 | 1.436 |
| 2.453999999999985 | 1.184 | 1.37 | 1.436 |
| 2.456999999999985 | 1.184 | 1.37 | 1.436 |
| 2.459999999999985 | 1.185 | 1.37 | 1.436 |
| 2.462999999999985 | 1.185 | 1.371 | 1.436 |
| 2.465999999999985 | 1.186 | 1.371 | 1.436 |
| 2.468999999999985 | 1.186 | 1.371 | 1.437 |
| 2.471999999999985 | 1.186 | 1.371 | 1.437 |
| 2.474999999999985 | 1.187 | 1.371 | 1.437 |
| 2.477999999999986 | 1.187 | 1.372 | 1.437 |
| 2.480999999999986 | 1.188 | 1.372 | 1.437 |
| 2.483999999999986 | 1.188 | 1.372 | 1.437 |
| 2.486999999999986 | 1.188 | 1.372 | 1.438 |
| 2.489999999999986 | 1.189 | 1.373 | 1.438 |
| 2.492999999999986 | 1.189 | 1.373 | 1.438 |
| 2.495999999999986 | 1.19 | 1.373 | 1.438 |
| 2.498999999999986 | 1.19 | 1.373 | 1.438 |
| 2.501999999999986 | 1.191 | 1.374 | 1.438 |
| 2.504999999999987 | 1.191 | 1.374 | 1.439 |
| 2.507999999999987 | 1.191 | 1.374 | 1.439 |
| 2.510999999999987 | 1.192 | 1.374 | 1.439 |
| 2.513999999999987 | 1.192 | 1.374 | 1.439 |
| 2.516999999999987 | 1.193 | 1.375 | 1.439 |
| 2.519999999999987 | 1.193 | 1.375 | 1.439 |
| 2.522999999999987 | 1.193 | 1.375 | 1.439 |
| 2.525999999999987 | 1.194 | 1.375 | 1.44 |
| 2.528999999999987 | 1.194 | 1.376 | 1.44 |
| 2.531999999999988 | 1.195 | 1.376 | 1.44 |
| 2.534999999999988 | 1.195 | 1.376 | 1.44 |
| 2.537999999999988 | 1.195 | 1.376 | 1.44 |
| 2.540999999999988 | 1.196 | 1.377 | 1.44 |
| 2.543999999999988 | 1.196 | 1.377 | 1.441 |
| 2.546999999999988 | 1.197 | 1.377 | 1.441 |
| 2.549999999999988 | 1.197 | 1.377 | 1.441 |
| 2.552999999999988 | 1.197 | 1.377 | 1.441 |
| 2.555999999999988 | 1.198 | 1.378 | 1.441 |
| 2.558999999999989 | 1.198 | 1.378 | 1.441 |
| 2.561999999999989 | 1.199 | 1.378 | 1.441 |
| 2.564999999999989 | 1.199 | 1.378 | 1.442 |
| 2.567999999999989 | 1.199 | 1.378 | 1.442 |
| 2.570999999999989 | 1.2 | 1.379 | 1.442 |
| 2.573999999999989 | 1.2 | 1.379 | 1.442 |
| 2.576999999999989 | 1.201 | 1.379 | 1.442 |
| 2.579999999999989 | 1.201 | 1.379 | 1.442 |
| 2.58299999999999 | 1.201 | 1.38 | 1.442 |
| 2.58599999999999 | 1.202 | 1.38 | 1.443 |
| 2.58899999999999 | 1.202 | 1.38 | 1.443 |
| 2.59199999999999 | 1.203 | 1.38 | 1.443 |
| 2.59499999999999 | 1.203 | 1.38 | 1.443 |
| 2.59799999999999 | 1.203 | 1.381 | 1.443 |
| 2.60099999999999 | 1.204 | 1.381 | 1.443 |
| 2.60399999999999 | 1.204 | 1.381 | 1.443 |
| 2.60699999999999 | 1.205 | 1.381 | 1.444 |
| 2.60999999999999 | 1.205 | 1.382 | 1.444 |
| 2.612999999999991 | 1.205 | 1.382 | 1.444 |
| 2.615999999999991 | 1.206 | 1.382 | 1.444 |
| 2.618999999999991 | 1.206 | 1.382 | 1.444 |
| 2.621999999999991 | 1.206 | 1.382 | 1.444 |
| 2.624999999999991 | 1.207 | 1.383 | 1.444 |
| 2.627999999999991 | 1.207 | 1.383 | 1.445 |
| 2.630999999999991 | 1.208 | 1.383 | 1.445 |
| 2.633999999999991 | 1.208 | 1.383 | 1.445 |
| 2.636999999999991 | 1.208 | 1.383 | 1.445 |
| 2.639999999999992 | 1.209 | 1.384 | 1.445 |
| 2.642999999999992 | 1.209 | 1.384 | 1.445 |
| 2.645999999999992 | 1.209 | 1.384 | 1.445 |
| 2.648999999999992 | 1.21 | 1.384 | 1.446 |
| 2.651999999999992 | 1.21 | 1.384 | 1.446 |
| 2.654999999999992 | 1.211 | 1.385 | 1.446 |
| 2.657999999999992 | 1.211 | 1.385 | 1.446 |
| 2.660999999999992 | 1.211 | 1.385 | 1.446 |
| 2.663999999999992 | 1.212 | 1.385 | 1.446 |
| 2.666999999999993 | 1.212 | 1.385 | 1.446 |
| 2.669999999999993 | 1.212 | 1.386 | 1.447 |
| 2.672999999999993 | 1.213 | 1.386 | 1.447 |
| 2.675999999999993 | 1.213 | 1.386 | 1.447 |
| 2.678999999999993 | 1.214 | 1.386 | 1.447 |
| 2.681999999999993 | 1.214 | 1.386 | 1.447 |
| 2.684999999999993 | 1.214 | 1.387 | 1.447 |
| 2.687999999999993 | 1.215 | 1.387 | 1.447 |
| 2.690999999999994 | 1.215 | 1.387 | 1.448 |
| 2.693999999999994 | 1.215 | 1.387 | 1.448 |
| 2.696999999999994 | 1.216 | 1.387 | 1.448 |
| 2.699999999999994 | 1.216 | 1.388 | 1.448 |
| 2.702999999999994 | 1.216 | 1.388 | 1.448 |
| 2.705999999999994 | 1.217 | 1.388 | 1.448 |
| 2.708999999999994 | 1.217 | 1.388 | 1.448 |
| 2.711999999999994 | 1.218 | 1.388 | 1.448 |
| 2.714999999999994 | 1.218 | 1.389 | 1.449 |
| 2.717999999999995 | 1.218 | 1.389 | 1.449 |
| 2.720999999999995 | 1.219 | 1.389 | 1.449 |
| 2.723999999999995 | 1.219 | 1.389 | 1.449 |
| 2.726999999999995 | 1.219 | 1.389 | 1.449 |
| 2.729999999999995 | 1.22 | 1.39 | 1.449 |
| 2.732999999999995 | 1.22 | 1.39 | 1.449 |
| 2.735999999999995 | 1.22 | 1.39 | 1.45 |
| 2.738999999999995 | 1.221 | 1.39 | 1.45 |
| 2.741999999999995 | 1.221 | 1.39 | 1.45 |
| 2.744999999999996 | 1.221 | 1.391 | 1.45 |
| 2.747999999999996 | 1.222 | 1.391 | 1.45 |
| 2.750999999999996 | 1.222 | 1.391 | 1.45 |
| 2.753999999999996 | 1.222 | 1.391 | 1.45 |
| 2.756999999999996 | 1.223 | 1.391 | 1.45 |
| 2.759999999999996 | 1.223 | 1.392 | 1.451 |
| 2.762999999999996 | 1.224 | 1.392 | 1.451 |
| 2.765999999999996 | 1.224 | 1.392 | 1.451 |
| 2.768999999999996 | 1.224 | 1.392 | 1.451 |
| 2.771999999999997 | 1.225 | 1.392 | 1.451 |
| 2.774999999999997 | 1.225 | 1.393 | 1.451 |
| 2.777999999999997 | 1.225 | 1.393 | 1.451 |
| 2.780999999999997 | 1.226 | 1.393 | 1.452 |
| 2.783999999999997 | 1.226 | 1.393 | 1.452 |
| 2.786999999999997 | 1.226 | 1.393 | 1.452 |
| 2.789999999999997 | 1.227 | 1.393 | 1.452 |
| 2.792999999999997 | 1.227 | 1.394 | 1.452 |
| 2.795999999999998 | 1.227 | 1.394 | 1.452 |
| 2.798999999999998 | 1.228 | 1.394 | 1.452 |
| 2.801999999999998 | 1.228 | 1.394 | 1.452 |
| 2.804999999999998 | 1.228 | 1.394 | 1.453 |
| 2.807999999999998 | 1.229 | 1.395 | 1.453 |
| 2.810999999999998 | 1.229 | 1.395 | 1.453 |
| 2.813999999999998 | 1.229 | 1.395 | 1.453 |
| 2.816999999999998 | 1.23 | 1.395 | 1.453 |
| 2.819999999999998 | 1.23 | 1.395 | 1.453 |
| 2.822999999999999 | 1.23 | 1.395 | 1.453 |
| 2.825999999999999 | 1.231 | 1.396 | 1.453 |
| 2.828999999999999 | 1.231 | 1.396 | 1.454 |
| 2.831999999999999 | 1.231 | 1.396 | 1.454 |
| 2.834999999999999 | 1.232 | 1.396 | 1.454 |
| 2.837999999999999 | 1.232 | 1.396 | 1.454 |
| 2.840999999999999 | 1.232 | 1.397 | 1.454 |
| 2.843999999999999 | 1.233 | 1.397 | 1.454 |
| 2.846999999999999 | 1.233 | 1.397 | 1.454 |
| 2.85 | 1.233 | 1.397 | 1.454 |
| 2.853 | 1.234 | 1.397 | 1.454 |
| 2.856 | 1.234 | 1.397 | 1.455 |
| 2.859 | 1.234 | 1.398 | 1.455 |
| 2.862 | 1.235 | 1.398 | 1.455 |
| 2.865 | 1.235 | 1.398 | 1.455 |
| 2.868 | 1.235 | 1.398 | 1.455 |
| 2.871 | 1.236 | 1.398 | 1.455 |
| 2.874000000000001 | 1.236 | 1.399 | 1.455 |
| 2.877000000000001 | 1.236 | 1.399 | 1.455 |
| 2.880000000000001 | 1.237 | 1.399 | 1.456 |
| 2.883000000000001 | 1.237 | 1.399 | 1.456 |
| 2.886000000000001 | 1.237 | 1.399 | 1.456 |
| 2.889000000000001 | 1.238 | 1.399 | 1.456 |
| 2.892000000000001 | 1.238 | 1.4 | 1.456 |
| 2.895000000000001 | 1.238 | 1.4 | 1.456 |
| 2.898000000000001 | 1.239 | 1.4 | 1.456 |
| 2.901000000000002 | 1.239 | 1.4 | 1.456 |
| 2.904000000000002 | 1.239 | 1.4 | 1.457 |
| 2.907000000000002 | 1.239 | 1.4 | 1.457 |
| 2.910000000000002 | 1.24 | 1.401 | 1.457 |
| 2.913000000000002 | 1.24 | 1.401 | 1.457 |
| 2.916000000000002 | 1.24 | 1.401 | 1.457 |
| 2.919000000000002 | 1.241 | 1.401 | 1.457 |
| 2.922000000000002 | 1.241 | 1.401 | 1.457 |
| 2.925000000000002 | 1.241 | 1.401 | 1.457 |
| 2.928000000000003 | 1.242 | 1.402 | 1.457 |
| 2.931000000000003 | 1.242 | 1.402 | 1.458 |
| 2.934000000000003 | 1.242 | 1.402 | 1.458 |
| 2.937000000000003 | 1.243 | 1.402 | 1.458 |
| 2.940000000000003 | 1.243 | 1.402 | 1.458 |
| 2.943000000000003 | 1.243 | 1.403 | 1.458 |
| 2.946000000000003 | 1.244 | 1.403 | 1.458 |
| 2.949000000000003 | 1.244 | 1.403 | 1.458 |
| 2.952000000000003 | 1.244 | 1.403 | 1.458 |
| 2.955000000000004 | 1.244 | 1.403 | 1.458 |
| 2.958000000000004 | 1.245 | 1.403 | 1.459 |
| 2.961000000000004 | 1.245 | 1.404 | 1.459 |
| 2.964000000000004 | 1.245 | 1.404 | 1.459 |
| 2.967000000000004 | 1.246 | 1.404 | 1.459 |
| 2.970000000000004 | 1.246 | 1.404 | 1.459 |
| 2.973000000000004 | 1.246 | 1.404 | 1.459 |
| 2.976000000000004 | 1.247 | 1.404 | 1.459 |
| 2.979000000000005 | 1.247 | 1.405 | 1.459 |
| 2.982000000000005 | 1.247 | 1.405 | 1.459 |
| 2.985000000000005 | 1.248 | 1.405 | 1.46 |
| 2.988000000000005 | 1.248 | 1.405 | 1.46 |
| 2.991000000000005 | 1.248 | 1.405 | 1.46 |
| 2.994000000000005 | 1.248 | 1.405 | 1.46 |
| 2.997000000000005 | 1.249 | 1.405 | 1.46 |
| 3.000000000000005 | 1.249 | 1.406 | 1.46 |